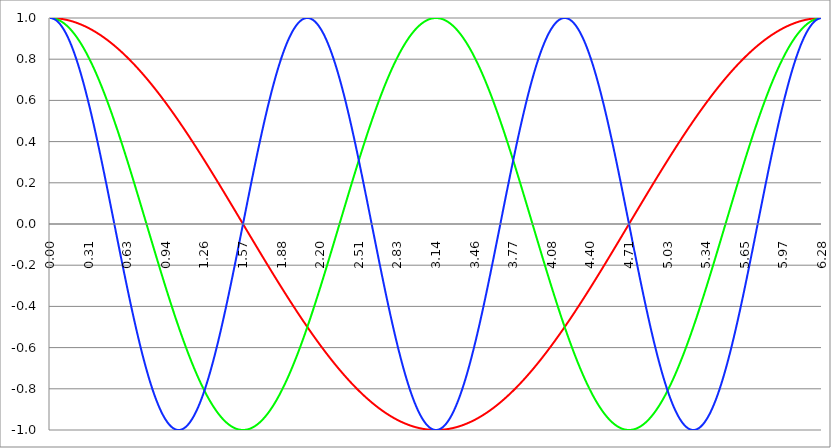
| Category | Series 1 | Series 0 | Series 2 |
|---|---|---|---|
| 0.0 | 1 | 1 | 1 |
| 0.00314159265358979 | 1 | 1 | 1 |
| 0.00628318530717958 | 1 | 1 | 1 |
| 0.00942477796076938 | 1 | 1 | 1 |
| 0.0125663706143592 | 1 | 1 | 0.999 |
| 0.015707963267949 | 1 | 1 | 0.999 |
| 0.0188495559215388 | 1 | 0.999 | 0.998 |
| 0.0219911485751285 | 1 | 0.999 | 0.998 |
| 0.0251327412287183 | 1 | 0.999 | 0.997 |
| 0.0282743338823081 | 1 | 0.998 | 0.996 |
| 0.0314159265358979 | 1 | 0.998 | 0.996 |
| 0.0345575191894877 | 0.999 | 0.998 | 0.995 |
| 0.0376991118430775 | 0.999 | 0.997 | 0.994 |
| 0.0408407044966673 | 0.999 | 0.997 | 0.993 |
| 0.0439822971502571 | 0.999 | 0.996 | 0.991 |
| 0.0471238898038469 | 0.999 | 0.996 | 0.99 |
| 0.0502654824574367 | 0.999 | 0.995 | 0.989 |
| 0.0534070751110265 | 0.999 | 0.994 | 0.987 |
| 0.0565486677646163 | 0.998 | 0.994 | 0.986 |
| 0.059690260418206 | 0.998 | 0.993 | 0.984 |
| 0.0628318530717958 | 0.998 | 0.992 | 0.982 |
| 0.0659734457253856 | 0.998 | 0.991 | 0.98 |
| 0.0691150383789754 | 0.998 | 0.99 | 0.979 |
| 0.0722566310325652 | 0.997 | 0.99 | 0.977 |
| 0.075398223686155 | 0.997 | 0.989 | 0.975 |
| 0.0785398163397448 | 0.997 | 0.988 | 0.972 |
| 0.0816814089933346 | 0.997 | 0.987 | 0.97 |
| 0.0848230016469244 | 0.996 | 0.986 | 0.968 |
| 0.0879645943005142 | 0.996 | 0.985 | 0.965 |
| 0.091106186954104 | 0.996 | 0.983 | 0.963 |
| 0.0942477796076937 | 0.996 | 0.982 | 0.96 |
| 0.0973893722612835 | 0.995 | 0.981 | 0.958 |
| 0.100530964914873 | 0.995 | 0.98 | 0.955 |
| 0.103672557568463 | 0.995 | 0.979 | 0.952 |
| 0.106814150222053 | 0.994 | 0.977 | 0.949 |
| 0.109955742875643 | 0.994 | 0.976 | 0.946 |
| 0.113097335529233 | 0.994 | 0.975 | 0.943 |
| 0.116238928182822 | 0.993 | 0.973 | 0.94 |
| 0.119380520836412 | 0.993 | 0.972 | 0.937 |
| 0.122522113490002 | 0.993 | 0.97 | 0.933 |
| 0.125663706143592 | 0.992 | 0.969 | 0.93 |
| 0.128805298797181 | 0.992 | 0.967 | 0.926 |
| 0.131946891450771 | 0.991 | 0.965 | 0.923 |
| 0.135088484104361 | 0.991 | 0.964 | 0.919 |
| 0.138230076757951 | 0.99 | 0.962 | 0.915 |
| 0.141371669411541 | 0.99 | 0.96 | 0.911 |
| 0.14451326206513 | 0.99 | 0.959 | 0.907 |
| 0.14765485471872 | 0.989 | 0.957 | 0.903 |
| 0.15079644737231 | 0.989 | 0.955 | 0.899 |
| 0.1539380400259 | 0.988 | 0.953 | 0.895 |
| 0.15707963267949 | 0.988 | 0.951 | 0.891 |
| 0.160221225333079 | 0.987 | 0.949 | 0.887 |
| 0.163362817986669 | 0.987 | 0.947 | 0.882 |
| 0.166504410640259 | 0.986 | 0.945 | 0.878 |
| 0.169646003293849 | 0.986 | 0.943 | 0.873 |
| 0.172787595947439 | 0.985 | 0.941 | 0.869 |
| 0.175929188601028 | 0.985 | 0.939 | 0.864 |
| 0.179070781254618 | 0.984 | 0.937 | 0.859 |
| 0.182212373908208 | 0.983 | 0.934 | 0.854 |
| 0.185353966561798 | 0.983 | 0.932 | 0.849 |
| 0.188495559215388 | 0.982 | 0.93 | 0.844 |
| 0.191637151868977 | 0.982 | 0.927 | 0.839 |
| 0.194778744522567 | 0.981 | 0.925 | 0.834 |
| 0.197920337176157 | 0.98 | 0.923 | 0.829 |
| 0.201061929829747 | 0.98 | 0.92 | 0.824 |
| 0.204203522483336 | 0.979 | 0.918 | 0.818 |
| 0.207345115136926 | 0.979 | 0.915 | 0.813 |
| 0.210486707790516 | 0.978 | 0.913 | 0.807 |
| 0.213628300444106 | 0.977 | 0.91 | 0.802 |
| 0.216769893097696 | 0.977 | 0.907 | 0.796 |
| 0.219911485751285 | 0.976 | 0.905 | 0.79 |
| 0.223053078404875 | 0.975 | 0.902 | 0.784 |
| 0.226194671058465 | 0.975 | 0.899 | 0.778 |
| 0.229336263712055 | 0.974 | 0.897 | 0.773 |
| 0.232477856365645 | 0.973 | 0.894 | 0.766 |
| 0.235619449019234 | 0.972 | 0.891 | 0.76 |
| 0.238761041672824 | 0.972 | 0.888 | 0.754 |
| 0.241902634326414 | 0.971 | 0.885 | 0.748 |
| 0.245044226980004 | 0.97 | 0.882 | 0.742 |
| 0.248185819633594 | 0.969 | 0.879 | 0.735 |
| 0.251327412287183 | 0.969 | 0.876 | 0.729 |
| 0.254469004940773 | 0.968 | 0.873 | 0.722 |
| 0.257610597594363 | 0.967 | 0.87 | 0.716 |
| 0.260752190247953 | 0.966 | 0.867 | 0.709 |
| 0.263893782901543 | 0.965 | 0.864 | 0.703 |
| 0.267035375555132 | 0.965 | 0.861 | 0.696 |
| 0.270176968208722 | 0.964 | 0.858 | 0.689 |
| 0.273318560862312 | 0.963 | 0.854 | 0.682 |
| 0.276460153515902 | 0.962 | 0.851 | 0.675 |
| 0.279601746169492 | 0.961 | 0.848 | 0.668 |
| 0.282743338823082 | 0.96 | 0.844 | 0.661 |
| 0.285884931476671 | 0.959 | 0.841 | 0.654 |
| 0.289026524130261 | 0.959 | 0.838 | 0.647 |
| 0.292168116783851 | 0.958 | 0.834 | 0.64 |
| 0.295309709437441 | 0.957 | 0.831 | 0.633 |
| 0.298451302091031 | 0.956 | 0.827 | 0.625 |
| 0.30159289474462 | 0.955 | 0.824 | 0.618 |
| 0.30473448739821 | 0.954 | 0.82 | 0.61 |
| 0.3078760800518 | 0.953 | 0.816 | 0.603 |
| 0.31101767270539 | 0.952 | 0.813 | 0.595 |
| 0.31415926535898 | 0.951 | 0.809 | 0.588 |
| 0.31730085801257 | 0.95 | 0.805 | 0.58 |
| 0.320442450666159 | 0.949 | 0.802 | 0.572 |
| 0.323584043319749 | 0.948 | 0.798 | 0.565 |
| 0.326725635973339 | 0.947 | 0.794 | 0.557 |
| 0.329867228626929 | 0.946 | 0.79 | 0.549 |
| 0.333008821280519 | 0.945 | 0.786 | 0.541 |
| 0.336150413934108 | 0.944 | 0.782 | 0.533 |
| 0.339292006587698 | 0.943 | 0.778 | 0.525 |
| 0.342433599241288 | 0.942 | 0.775 | 0.517 |
| 0.345575191894878 | 0.941 | 0.771 | 0.509 |
| 0.348716784548468 | 0.94 | 0.766 | 0.501 |
| 0.351858377202058 | 0.939 | 0.762 | 0.493 |
| 0.354999969855647 | 0.938 | 0.758 | 0.485 |
| 0.358141562509237 | 0.937 | 0.754 | 0.476 |
| 0.361283155162827 | 0.935 | 0.75 | 0.468 |
| 0.364424747816417 | 0.934 | 0.746 | 0.46 |
| 0.367566340470007 | 0.933 | 0.742 | 0.451 |
| 0.370707933123597 | 0.932 | 0.738 | 0.443 |
| 0.373849525777186 | 0.931 | 0.733 | 0.434 |
| 0.376991118430776 | 0.93 | 0.729 | 0.426 |
| 0.380132711084366 | 0.929 | 0.725 | 0.417 |
| 0.383274303737956 | 0.927 | 0.72 | 0.409 |
| 0.386415896391546 | 0.926 | 0.716 | 0.4 |
| 0.389557489045135 | 0.925 | 0.712 | 0.391 |
| 0.392699081698725 | 0.924 | 0.707 | 0.383 |
| 0.395840674352315 | 0.923 | 0.703 | 0.374 |
| 0.398982267005905 | 0.921 | 0.698 | 0.365 |
| 0.402123859659495 | 0.92 | 0.694 | 0.356 |
| 0.405265452313085 | 0.919 | 0.689 | 0.348 |
| 0.408407044966674 | 0.918 | 0.685 | 0.339 |
| 0.411548637620264 | 0.917 | 0.68 | 0.33 |
| 0.414690230273854 | 0.915 | 0.675 | 0.321 |
| 0.417831822927444 | 0.914 | 0.671 | 0.312 |
| 0.420973415581034 | 0.913 | 0.666 | 0.303 |
| 0.424115008234623 | 0.911 | 0.661 | 0.294 |
| 0.427256600888213 | 0.91 | 0.657 | 0.285 |
| 0.430398193541803 | 0.909 | 0.652 | 0.276 |
| 0.433539786195393 | 0.907 | 0.647 | 0.267 |
| 0.436681378848983 | 0.906 | 0.642 | 0.258 |
| 0.439822971502573 | 0.905 | 0.637 | 0.249 |
| 0.442964564156162 | 0.903 | 0.633 | 0.24 |
| 0.446106156809752 | 0.902 | 0.628 | 0.23 |
| 0.449247749463342 | 0.901 | 0.623 | 0.221 |
| 0.452389342116932 | 0.899 | 0.618 | 0.212 |
| 0.455530934770522 | 0.898 | 0.613 | 0.203 |
| 0.458672527424111 | 0.897 | 0.608 | 0.194 |
| 0.461814120077701 | 0.895 | 0.603 | 0.184 |
| 0.464955712731291 | 0.894 | 0.598 | 0.175 |
| 0.468097305384881 | 0.892 | 0.593 | 0.166 |
| 0.471238898038471 | 0.891 | 0.588 | 0.156 |
| 0.474380490692061 | 0.89 | 0.583 | 0.147 |
| 0.47752208334565 | 0.888 | 0.578 | 0.138 |
| 0.48066367599924 | 0.887 | 0.572 | 0.128 |
| 0.48380526865283 | 0.885 | 0.567 | 0.119 |
| 0.48694686130642 | 0.884 | 0.562 | 0.11 |
| 0.49008845396001 | 0.882 | 0.557 | 0.1 |
| 0.493230046613599 | 0.881 | 0.552 | 0.091 |
| 0.496371639267189 | 0.879 | 0.546 | 0.082 |
| 0.499513231920779 | 0.878 | 0.541 | 0.072 |
| 0.502654824574369 | 0.876 | 0.536 | 0.063 |
| 0.505796417227959 | 0.875 | 0.531 | 0.053 |
| 0.508938009881549 | 0.873 | 0.525 | 0.044 |
| 0.512079602535138 | 0.872 | 0.52 | 0.035 |
| 0.515221195188728 | 0.87 | 0.514 | 0.025 |
| 0.518362787842318 | 0.869 | 0.509 | 0.016 |
| 0.521504380495908 | 0.867 | 0.504 | 0.006 |
| 0.524645973149498 | 0.866 | 0.498 | -0.003 |
| 0.527787565803087 | 0.864 | 0.493 | -0.013 |
| 0.530929158456677 | 0.862 | 0.487 | -0.022 |
| 0.534070751110267 | 0.861 | 0.482 | -0.031 |
| 0.537212343763857 | 0.859 | 0.476 | -0.041 |
| 0.540353936417447 | 0.858 | 0.471 | -0.05 |
| 0.543495529071037 | 0.856 | 0.465 | -0.06 |
| 0.546637121724626 | 0.854 | 0.46 | -0.069 |
| 0.549778714378216 | 0.853 | 0.454 | -0.078 |
| 0.552920307031806 | 0.851 | 0.448 | -0.088 |
| 0.556061899685396 | 0.849 | 0.443 | -0.097 |
| 0.559203492338986 | 0.848 | 0.437 | -0.107 |
| 0.562345084992576 | 0.846 | 0.431 | -0.116 |
| 0.565486677646165 | 0.844 | 0.426 | -0.125 |
| 0.568628270299755 | 0.843 | 0.42 | -0.135 |
| 0.571769862953345 | 0.841 | 0.414 | -0.144 |
| 0.574911455606935 | 0.839 | 0.409 | -0.153 |
| 0.578053048260525 | 0.838 | 0.403 | -0.163 |
| 0.581194640914114 | 0.836 | 0.397 | -0.172 |
| 0.584336233567704 | 0.834 | 0.391 | -0.181 |
| 0.587477826221294 | 0.832 | 0.386 | -0.19 |
| 0.590619418874884 | 0.831 | 0.38 | -0.2 |
| 0.593761011528474 | 0.829 | 0.374 | -0.209 |
| 0.596902604182064 | 0.827 | 0.368 | -0.218 |
| 0.600044196835653 | 0.825 | 0.362 | -0.227 |
| 0.603185789489243 | 0.824 | 0.356 | -0.236 |
| 0.606327382142833 | 0.822 | 0.351 | -0.246 |
| 0.609468974796423 | 0.82 | 0.345 | -0.255 |
| 0.612610567450013 | 0.818 | 0.339 | -0.264 |
| 0.615752160103602 | 0.816 | 0.333 | -0.273 |
| 0.618893752757192 | 0.815 | 0.327 | -0.282 |
| 0.622035345410782 | 0.813 | 0.321 | -0.291 |
| 0.625176938064372 | 0.811 | 0.315 | -0.3 |
| 0.628318530717962 | 0.809 | 0.309 | -0.309 |
| 0.631460123371551 | 0.807 | 0.303 | -0.318 |
| 0.634601716025141 | 0.805 | 0.297 | -0.327 |
| 0.637743308678731 | 0.803 | 0.291 | -0.336 |
| 0.640884901332321 | 0.802 | 0.285 | -0.345 |
| 0.644026493985911 | 0.8 | 0.279 | -0.353 |
| 0.647168086639501 | 0.798 | 0.273 | -0.362 |
| 0.65030967929309 | 0.796 | 0.267 | -0.371 |
| 0.65345127194668 | 0.794 | 0.261 | -0.38 |
| 0.65659286460027 | 0.792 | 0.255 | -0.388 |
| 0.65973445725386 | 0.79 | 0.249 | -0.397 |
| 0.66287604990745 | 0.788 | 0.243 | -0.406 |
| 0.666017642561039 | 0.786 | 0.236 | -0.414 |
| 0.669159235214629 | 0.784 | 0.23 | -0.423 |
| 0.672300827868219 | 0.782 | 0.224 | -0.431 |
| 0.675442420521809 | 0.78 | 0.218 | -0.44 |
| 0.678584013175399 | 0.778 | 0.212 | -0.448 |
| 0.681725605828989 | 0.776 | 0.206 | -0.457 |
| 0.684867198482578 | 0.775 | 0.2 | -0.465 |
| 0.688008791136168 | 0.773 | 0.194 | -0.473 |
| 0.691150383789758 | 0.771 | 0.187 | -0.482 |
| 0.694291976443348 | 0.769 | 0.181 | -0.49 |
| 0.697433569096938 | 0.766 | 0.175 | -0.498 |
| 0.700575161750528 | 0.764 | 0.169 | -0.506 |
| 0.703716754404117 | 0.762 | 0.163 | -0.514 |
| 0.706858347057707 | 0.76 | 0.156 | -0.522 |
| 0.709999939711297 | 0.758 | 0.15 | -0.531 |
| 0.713141532364887 | 0.756 | 0.144 | -0.538 |
| 0.716283125018477 | 0.754 | 0.138 | -0.546 |
| 0.719424717672066 | 0.752 | 0.132 | -0.554 |
| 0.722566310325656 | 0.75 | 0.125 | -0.562 |
| 0.725707902979246 | 0.748 | 0.119 | -0.57 |
| 0.728849495632836 | 0.746 | 0.113 | -0.578 |
| 0.731991088286426 | 0.744 | 0.107 | -0.585 |
| 0.735132680940016 | 0.742 | 0.1 | -0.593 |
| 0.738274273593605 | 0.74 | 0.094 | -0.6 |
| 0.741415866247195 | 0.738 | 0.088 | -0.608 |
| 0.744557458900785 | 0.735 | 0.082 | -0.615 |
| 0.747699051554375 | 0.733 | 0.075 | -0.623 |
| 0.750840644207965 | 0.731 | 0.069 | -0.63 |
| 0.753982236861554 | 0.729 | 0.063 | -0.637 |
| 0.757123829515144 | 0.727 | 0.057 | -0.645 |
| 0.760265422168734 | 0.725 | 0.05 | -0.652 |
| 0.763407014822324 | 0.722 | 0.044 | -0.659 |
| 0.766548607475914 | 0.72 | 0.038 | -0.666 |
| 0.769690200129504 | 0.718 | 0.031 | -0.673 |
| 0.772831792783093 | 0.716 | 0.025 | -0.68 |
| 0.775973385436683 | 0.714 | 0.019 | -0.687 |
| 0.779114978090273 | 0.712 | 0.013 | -0.694 |
| 0.782256570743863 | 0.709 | 0.006 | -0.7 |
| 0.785398163397453 | 0.707 | 0 | -0.707 |
| 0.788539756051042 | 0.705 | -0.006 | -0.714 |
| 0.791681348704632 | 0.703 | -0.013 | -0.72 |
| 0.794822941358222 | 0.7 | -0.019 | -0.727 |
| 0.797964534011812 | 0.698 | -0.025 | -0.733 |
| 0.801106126665402 | 0.696 | -0.031 | -0.74 |
| 0.804247719318992 | 0.694 | -0.038 | -0.746 |
| 0.807389311972581 | 0.691 | -0.044 | -0.752 |
| 0.810530904626171 | 0.689 | -0.05 | -0.758 |
| 0.813672497279761 | 0.687 | -0.057 | -0.764 |
| 0.816814089933351 | 0.685 | -0.063 | -0.771 |
| 0.819955682586941 | 0.682 | -0.069 | -0.776 |
| 0.823097275240531 | 0.68 | -0.075 | -0.782 |
| 0.82623886789412 | 0.678 | -0.082 | -0.788 |
| 0.82938046054771 | 0.675 | -0.088 | -0.794 |
| 0.8325220532013 | 0.673 | -0.094 | -0.8 |
| 0.83566364585489 | 0.671 | -0.1 | -0.805 |
| 0.83880523850848 | 0.668 | -0.107 | -0.811 |
| 0.841946831162069 | 0.666 | -0.113 | -0.816 |
| 0.845088423815659 | 0.664 | -0.119 | -0.822 |
| 0.848230016469249 | 0.661 | -0.125 | -0.827 |
| 0.851371609122839 | 0.659 | -0.132 | -0.832 |
| 0.854513201776429 | 0.657 | -0.138 | -0.838 |
| 0.857654794430019 | 0.654 | -0.144 | -0.843 |
| 0.860796387083608 | 0.652 | -0.15 | -0.848 |
| 0.863937979737198 | 0.649 | -0.156 | -0.853 |
| 0.867079572390788 | 0.647 | -0.163 | -0.858 |
| 0.870221165044378 | 0.645 | -0.169 | -0.862 |
| 0.873362757697968 | 0.642 | -0.175 | -0.867 |
| 0.876504350351557 | 0.64 | -0.181 | -0.872 |
| 0.879645943005147 | 0.637 | -0.187 | -0.876 |
| 0.882787535658737 | 0.635 | -0.194 | -0.881 |
| 0.885929128312327 | 0.633 | -0.2 | -0.885 |
| 0.889070720965917 | 0.63 | -0.206 | -0.89 |
| 0.892212313619507 | 0.628 | -0.212 | -0.894 |
| 0.895353906273096 | 0.625 | -0.218 | -0.898 |
| 0.898495498926686 | 0.623 | -0.224 | -0.902 |
| 0.901637091580276 | 0.62 | -0.23 | -0.906 |
| 0.904778684233866 | 0.618 | -0.236 | -0.91 |
| 0.907920276887456 | 0.615 | -0.243 | -0.914 |
| 0.911061869541045 | 0.613 | -0.249 | -0.918 |
| 0.914203462194635 | 0.61 | -0.255 | -0.921 |
| 0.917345054848225 | 0.608 | -0.261 | -0.925 |
| 0.920486647501815 | 0.605 | -0.267 | -0.929 |
| 0.923628240155405 | 0.603 | -0.273 | -0.932 |
| 0.926769832808995 | 0.6 | -0.279 | -0.935 |
| 0.929911425462584 | 0.598 | -0.285 | -0.939 |
| 0.933053018116174 | 0.595 | -0.291 | -0.942 |
| 0.936194610769764 | 0.593 | -0.297 | -0.945 |
| 0.939336203423354 | 0.59 | -0.303 | -0.948 |
| 0.942477796076944 | 0.588 | -0.309 | -0.951 |
| 0.945619388730533 | 0.585 | -0.315 | -0.954 |
| 0.948760981384123 | 0.583 | -0.321 | -0.957 |
| 0.951902574037713 | 0.58 | -0.327 | -0.959 |
| 0.955044166691303 | 0.578 | -0.333 | -0.962 |
| 0.958185759344893 | 0.575 | -0.339 | -0.965 |
| 0.961327351998483 | 0.572 | -0.345 | -0.967 |
| 0.964468944652072 | 0.57 | -0.351 | -0.969 |
| 0.967610537305662 | 0.567 | -0.356 | -0.972 |
| 0.970752129959252 | 0.565 | -0.362 | -0.974 |
| 0.973893722612842 | 0.562 | -0.368 | -0.976 |
| 0.977035315266432 | 0.559 | -0.374 | -0.978 |
| 0.980176907920022 | 0.557 | -0.38 | -0.98 |
| 0.983318500573611 | 0.554 | -0.386 | -0.982 |
| 0.986460093227201 | 0.552 | -0.391 | -0.983 |
| 0.989601685880791 | 0.549 | -0.397 | -0.985 |
| 0.992743278534381 | 0.546 | -0.403 | -0.987 |
| 0.995884871187971 | 0.544 | -0.409 | -0.988 |
| 0.99902646384156 | 0.541 | -0.414 | -0.99 |
| 1.00216805649515 | 0.538 | -0.42 | -0.991 |
| 1.00530964914874 | 0.536 | -0.426 | -0.992 |
| 1.00845124180233 | 0.533 | -0.431 | -0.993 |
| 1.01159283445592 | 0.531 | -0.437 | -0.994 |
| 1.01473442710951 | 0.528 | -0.443 | -0.995 |
| 1.017876019763099 | 0.525 | -0.448 | -0.996 |
| 1.021017612416689 | 0.522 | -0.454 | -0.997 |
| 1.02415920507028 | 0.52 | -0.46 | -0.998 |
| 1.027300797723869 | 0.517 | -0.465 | -0.998 |
| 1.030442390377459 | 0.514 | -0.471 | -0.999 |
| 1.033583983031048 | 0.512 | -0.476 | -0.999 |
| 1.036725575684638 | 0.509 | -0.482 | -1 |
| 1.039867168338228 | 0.506 | -0.487 | -1 |
| 1.043008760991818 | 0.504 | -0.493 | -1 |
| 1.046150353645408 | 0.501 | -0.498 | -1 |
| 1.049291946298998 | 0.498 | -0.504 | -1 |
| 1.052433538952587 | 0.495 | -0.509 | -1 |
| 1.055575131606177 | 0.493 | -0.514 | -1 |
| 1.058716724259767 | 0.49 | -0.52 | -0.999 |
| 1.061858316913357 | 0.487 | -0.525 | -0.999 |
| 1.064999909566947 | 0.485 | -0.531 | -0.999 |
| 1.068141502220536 | 0.482 | -0.536 | -0.998 |
| 1.071283094874126 | 0.479 | -0.541 | -0.997 |
| 1.074424687527716 | 0.476 | -0.546 | -0.997 |
| 1.077566280181306 | 0.473 | -0.552 | -0.996 |
| 1.080707872834896 | 0.471 | -0.557 | -0.995 |
| 1.083849465488486 | 0.468 | -0.562 | -0.994 |
| 1.086991058142075 | 0.465 | -0.567 | -0.993 |
| 1.090132650795665 | 0.462 | -0.572 | -0.992 |
| 1.093274243449255 | 0.46 | -0.578 | -0.99 |
| 1.096415836102845 | 0.457 | -0.583 | -0.989 |
| 1.099557428756435 | 0.454 | -0.588 | -0.988 |
| 1.102699021410025 | 0.451 | -0.593 | -0.986 |
| 1.105840614063614 | 0.448 | -0.598 | -0.985 |
| 1.108982206717204 | 0.446 | -0.603 | -0.983 |
| 1.112123799370794 | 0.443 | -0.608 | -0.981 |
| 1.115265392024384 | 0.44 | -0.613 | -0.979 |
| 1.118406984677974 | 0.437 | -0.618 | -0.977 |
| 1.121548577331563 | 0.434 | -0.623 | -0.975 |
| 1.124690169985153 | 0.431 | -0.628 | -0.973 |
| 1.127831762638743 | 0.429 | -0.633 | -0.971 |
| 1.130973355292333 | 0.426 | -0.637 | -0.969 |
| 1.134114947945923 | 0.423 | -0.642 | -0.966 |
| 1.137256540599513 | 0.42 | -0.647 | -0.964 |
| 1.140398133253102 | 0.417 | -0.652 | -0.961 |
| 1.143539725906692 | 0.414 | -0.657 | -0.959 |
| 1.146681318560282 | 0.412 | -0.661 | -0.956 |
| 1.149822911213872 | 0.409 | -0.666 | -0.953 |
| 1.152964503867462 | 0.406 | -0.671 | -0.95 |
| 1.156106096521051 | 0.403 | -0.675 | -0.947 |
| 1.159247689174641 | 0.4 | -0.68 | -0.944 |
| 1.162389281828231 | 0.397 | -0.685 | -0.941 |
| 1.165530874481821 | 0.394 | -0.689 | -0.938 |
| 1.168672467135411 | 0.391 | -0.694 | -0.934 |
| 1.171814059789001 | 0.388 | -0.698 | -0.931 |
| 1.17495565244259 | 0.386 | -0.703 | -0.927 |
| 1.17809724509618 | 0.383 | -0.707 | -0.924 |
| 1.18123883774977 | 0.38 | -0.712 | -0.92 |
| 1.18438043040336 | 0.377 | -0.716 | -0.917 |
| 1.18752202305695 | 0.374 | -0.72 | -0.913 |
| 1.190663615710539 | 0.371 | -0.725 | -0.909 |
| 1.193805208364129 | 0.368 | -0.729 | -0.905 |
| 1.19694680101772 | 0.365 | -0.733 | -0.901 |
| 1.200088393671309 | 0.362 | -0.738 | -0.897 |
| 1.203229986324899 | 0.359 | -0.742 | -0.892 |
| 1.206371578978489 | 0.356 | -0.746 | -0.888 |
| 1.209513171632078 | 0.353 | -0.75 | -0.884 |
| 1.212654764285668 | 0.351 | -0.754 | -0.879 |
| 1.215796356939258 | 0.348 | -0.758 | -0.875 |
| 1.218937949592848 | 0.345 | -0.762 | -0.87 |
| 1.222079542246438 | 0.342 | -0.766 | -0.866 |
| 1.225221134900027 | 0.339 | -0.771 | -0.861 |
| 1.228362727553617 | 0.336 | -0.775 | -0.856 |
| 1.231504320207207 | 0.333 | -0.778 | -0.851 |
| 1.234645912860797 | 0.33 | -0.782 | -0.846 |
| 1.237787505514387 | 0.327 | -0.786 | -0.841 |
| 1.240929098167977 | 0.324 | -0.79 | -0.836 |
| 1.244070690821566 | 0.321 | -0.794 | -0.831 |
| 1.247212283475156 | 0.318 | -0.798 | -0.825 |
| 1.250353876128746 | 0.315 | -0.802 | -0.82 |
| 1.253495468782336 | 0.312 | -0.805 | -0.815 |
| 1.256637061435926 | 0.309 | -0.809 | -0.809 |
| 1.259778654089515 | 0.306 | -0.813 | -0.803 |
| 1.262920246743105 | 0.303 | -0.816 | -0.798 |
| 1.266061839396695 | 0.3 | -0.82 | -0.792 |
| 1.269203432050285 | 0.297 | -0.824 | -0.786 |
| 1.272345024703875 | 0.294 | -0.827 | -0.78 |
| 1.275486617357465 | 0.291 | -0.831 | -0.775 |
| 1.278628210011054 | 0.288 | -0.834 | -0.769 |
| 1.281769802664644 | 0.285 | -0.838 | -0.762 |
| 1.284911395318234 | 0.282 | -0.841 | -0.756 |
| 1.288052987971824 | 0.279 | -0.844 | -0.75 |
| 1.291194580625414 | 0.276 | -0.848 | -0.744 |
| 1.294336173279003 | 0.273 | -0.851 | -0.738 |
| 1.297477765932593 | 0.27 | -0.854 | -0.731 |
| 1.300619358586183 | 0.267 | -0.858 | -0.725 |
| 1.303760951239773 | 0.264 | -0.861 | -0.718 |
| 1.306902543893363 | 0.261 | -0.864 | -0.712 |
| 1.310044136546953 | 0.258 | -0.867 | -0.705 |
| 1.313185729200542 | 0.255 | -0.87 | -0.698 |
| 1.316327321854132 | 0.252 | -0.873 | -0.691 |
| 1.319468914507722 | 0.249 | -0.876 | -0.685 |
| 1.322610507161312 | 0.246 | -0.879 | -0.678 |
| 1.325752099814902 | 0.243 | -0.882 | -0.671 |
| 1.328893692468491 | 0.24 | -0.885 | -0.664 |
| 1.332035285122081 | 0.236 | -0.888 | -0.657 |
| 1.335176877775671 | 0.233 | -0.891 | -0.649 |
| 1.338318470429261 | 0.23 | -0.894 | -0.642 |
| 1.341460063082851 | 0.227 | -0.897 | -0.635 |
| 1.344601655736441 | 0.224 | -0.899 | -0.628 |
| 1.34774324839003 | 0.221 | -0.902 | -0.62 |
| 1.35088484104362 | 0.218 | -0.905 | -0.613 |
| 1.35402643369721 | 0.215 | -0.907 | -0.605 |
| 1.3571680263508 | 0.212 | -0.91 | -0.598 |
| 1.36030961900439 | 0.209 | -0.913 | -0.59 |
| 1.363451211657979 | 0.206 | -0.915 | -0.583 |
| 1.36659280431157 | 0.203 | -0.918 | -0.575 |
| 1.369734396965159 | 0.2 | -0.92 | -0.567 |
| 1.372875989618749 | 0.197 | -0.923 | -0.559 |
| 1.376017582272339 | 0.194 | -0.925 | -0.552 |
| 1.379159174925929 | 0.19 | -0.927 | -0.544 |
| 1.382300767579518 | 0.187 | -0.93 | -0.536 |
| 1.385442360233108 | 0.184 | -0.932 | -0.528 |
| 1.388583952886698 | 0.181 | -0.934 | -0.52 |
| 1.391725545540288 | 0.178 | -0.937 | -0.512 |
| 1.394867138193878 | 0.175 | -0.939 | -0.504 |
| 1.398008730847468 | 0.172 | -0.941 | -0.495 |
| 1.401150323501057 | 0.169 | -0.943 | -0.487 |
| 1.404291916154647 | 0.166 | -0.945 | -0.479 |
| 1.407433508808237 | 0.163 | -0.947 | -0.471 |
| 1.410575101461827 | 0.16 | -0.949 | -0.462 |
| 1.413716694115417 | 0.156 | -0.951 | -0.454 |
| 1.416858286769006 | 0.153 | -0.953 | -0.446 |
| 1.419999879422596 | 0.15 | -0.955 | -0.437 |
| 1.423141472076186 | 0.147 | -0.957 | -0.429 |
| 1.426283064729776 | 0.144 | -0.959 | -0.42 |
| 1.429424657383366 | 0.141 | -0.96 | -0.412 |
| 1.432566250036956 | 0.138 | -0.962 | -0.403 |
| 1.435707842690545 | 0.135 | -0.964 | -0.394 |
| 1.438849435344135 | 0.132 | -0.965 | -0.386 |
| 1.441991027997725 | 0.128 | -0.967 | -0.377 |
| 1.445132620651315 | 0.125 | -0.969 | -0.368 |
| 1.448274213304905 | 0.122 | -0.97 | -0.359 |
| 1.451415805958494 | 0.119 | -0.972 | -0.351 |
| 1.454557398612084 | 0.116 | -0.973 | -0.342 |
| 1.457698991265674 | 0.113 | -0.975 | -0.333 |
| 1.460840583919264 | 0.11 | -0.976 | -0.324 |
| 1.463982176572854 | 0.107 | -0.977 | -0.315 |
| 1.467123769226444 | 0.103 | -0.979 | -0.306 |
| 1.470265361880033 | 0.1 | -0.98 | -0.297 |
| 1.473406954533623 | 0.097 | -0.981 | -0.288 |
| 1.476548547187213 | 0.094 | -0.982 | -0.279 |
| 1.479690139840803 | 0.091 | -0.983 | -0.27 |
| 1.482831732494393 | 0.088 | -0.985 | -0.261 |
| 1.485973325147982 | 0.085 | -0.986 | -0.252 |
| 1.489114917801572 | 0.082 | -0.987 | -0.243 |
| 1.492256510455162 | 0.078 | -0.988 | -0.233 |
| 1.495398103108752 | 0.075 | -0.989 | -0.224 |
| 1.498539695762342 | 0.072 | -0.99 | -0.215 |
| 1.501681288415932 | 0.069 | -0.99 | -0.206 |
| 1.504822881069521 | 0.066 | -0.991 | -0.197 |
| 1.507964473723111 | 0.063 | -0.992 | -0.187 |
| 1.511106066376701 | 0.06 | -0.993 | -0.178 |
| 1.514247659030291 | 0.057 | -0.994 | -0.169 |
| 1.517389251683881 | 0.053 | -0.994 | -0.16 |
| 1.520530844337471 | 0.05 | -0.995 | -0.15 |
| 1.52367243699106 | 0.047 | -0.996 | -0.141 |
| 1.52681402964465 | 0.044 | -0.996 | -0.132 |
| 1.52995562229824 | 0.041 | -0.997 | -0.122 |
| 1.53309721495183 | 0.038 | -0.997 | -0.113 |
| 1.53623880760542 | 0.035 | -0.998 | -0.103 |
| 1.539380400259009 | 0.031 | -0.998 | -0.094 |
| 1.542521992912599 | 0.028 | -0.998 | -0.085 |
| 1.545663585566189 | 0.025 | -0.999 | -0.075 |
| 1.548805178219779 | 0.022 | -0.999 | -0.066 |
| 1.551946770873369 | 0.019 | -0.999 | -0.057 |
| 1.555088363526959 | 0.016 | -1 | -0.047 |
| 1.558229956180548 | 0.013 | -1 | -0.038 |
| 1.561371548834138 | 0.009 | -1 | -0.028 |
| 1.564513141487728 | 0.006 | -1 | -0.019 |
| 1.567654734141318 | 0.003 | -1 | -0.009 |
| 1.570796326794908 | 0 | -1 | 0 |
| 1.573937919448497 | -0.003 | -1 | 0.009 |
| 1.577079512102087 | -0.006 | -1 | 0.019 |
| 1.580221104755677 | -0.009 | -1 | 0.028 |
| 1.583362697409267 | -0.013 | -1 | 0.038 |
| 1.586504290062857 | -0.016 | -1 | 0.047 |
| 1.589645882716447 | -0.019 | -0.999 | 0.057 |
| 1.592787475370036 | -0.022 | -0.999 | 0.066 |
| 1.595929068023626 | -0.025 | -0.999 | 0.075 |
| 1.599070660677216 | -0.028 | -0.998 | 0.085 |
| 1.602212253330806 | -0.031 | -0.998 | 0.094 |
| 1.605353845984396 | -0.035 | -0.998 | 0.103 |
| 1.608495438637985 | -0.038 | -0.997 | 0.113 |
| 1.611637031291575 | -0.041 | -0.997 | 0.122 |
| 1.614778623945165 | -0.044 | -0.996 | 0.132 |
| 1.617920216598755 | -0.047 | -0.996 | 0.141 |
| 1.621061809252345 | -0.05 | -0.995 | 0.15 |
| 1.624203401905935 | -0.053 | -0.994 | 0.16 |
| 1.627344994559524 | -0.057 | -0.994 | 0.169 |
| 1.630486587213114 | -0.06 | -0.993 | 0.178 |
| 1.633628179866704 | -0.063 | -0.992 | 0.187 |
| 1.636769772520294 | -0.066 | -0.991 | 0.197 |
| 1.639911365173884 | -0.069 | -0.99 | 0.206 |
| 1.643052957827473 | -0.072 | -0.99 | 0.215 |
| 1.646194550481063 | -0.075 | -0.989 | 0.224 |
| 1.649336143134653 | -0.078 | -0.988 | 0.233 |
| 1.652477735788243 | -0.082 | -0.987 | 0.243 |
| 1.655619328441833 | -0.085 | -0.986 | 0.252 |
| 1.658760921095423 | -0.088 | -0.985 | 0.261 |
| 1.661902513749012 | -0.091 | -0.983 | 0.27 |
| 1.665044106402602 | -0.094 | -0.982 | 0.279 |
| 1.668185699056192 | -0.097 | -0.981 | 0.288 |
| 1.671327291709782 | -0.1 | -0.98 | 0.297 |
| 1.674468884363372 | -0.103 | -0.979 | 0.306 |
| 1.677610477016961 | -0.107 | -0.977 | 0.315 |
| 1.680752069670551 | -0.11 | -0.976 | 0.324 |
| 1.683893662324141 | -0.113 | -0.975 | 0.333 |
| 1.687035254977731 | -0.116 | -0.973 | 0.342 |
| 1.690176847631321 | -0.119 | -0.972 | 0.351 |
| 1.693318440284911 | -0.122 | -0.97 | 0.359 |
| 1.6964600329385 | -0.125 | -0.969 | 0.368 |
| 1.69960162559209 | -0.128 | -0.967 | 0.377 |
| 1.70274321824568 | -0.132 | -0.965 | 0.386 |
| 1.70588481089927 | -0.135 | -0.964 | 0.394 |
| 1.70902640355286 | -0.138 | -0.962 | 0.403 |
| 1.712167996206449 | -0.141 | -0.96 | 0.412 |
| 1.715309588860039 | -0.144 | -0.959 | 0.42 |
| 1.71845118151363 | -0.147 | -0.957 | 0.429 |
| 1.721592774167219 | -0.15 | -0.955 | 0.437 |
| 1.724734366820809 | -0.153 | -0.953 | 0.446 |
| 1.727875959474399 | -0.156 | -0.951 | 0.454 |
| 1.731017552127988 | -0.16 | -0.949 | 0.462 |
| 1.734159144781578 | -0.163 | -0.947 | 0.471 |
| 1.737300737435168 | -0.166 | -0.945 | 0.479 |
| 1.740442330088758 | -0.169 | -0.943 | 0.487 |
| 1.743583922742348 | -0.172 | -0.941 | 0.495 |
| 1.746725515395937 | -0.175 | -0.939 | 0.504 |
| 1.749867108049527 | -0.178 | -0.937 | 0.512 |
| 1.753008700703117 | -0.181 | -0.934 | 0.52 |
| 1.756150293356707 | -0.184 | -0.932 | 0.528 |
| 1.759291886010297 | -0.187 | -0.93 | 0.536 |
| 1.762433478663887 | -0.19 | -0.927 | 0.544 |
| 1.765575071317476 | -0.194 | -0.925 | 0.552 |
| 1.768716663971066 | -0.197 | -0.923 | 0.559 |
| 1.771858256624656 | -0.2 | -0.92 | 0.567 |
| 1.774999849278246 | -0.203 | -0.918 | 0.575 |
| 1.778141441931836 | -0.206 | -0.915 | 0.583 |
| 1.781283034585426 | -0.209 | -0.913 | 0.59 |
| 1.784424627239015 | -0.212 | -0.91 | 0.598 |
| 1.787566219892605 | -0.215 | -0.907 | 0.605 |
| 1.790707812546195 | -0.218 | -0.905 | 0.613 |
| 1.793849405199785 | -0.221 | -0.902 | 0.62 |
| 1.796990997853375 | -0.224 | -0.899 | 0.628 |
| 1.800132590506964 | -0.227 | -0.897 | 0.635 |
| 1.803274183160554 | -0.23 | -0.894 | 0.642 |
| 1.806415775814144 | -0.233 | -0.891 | 0.649 |
| 1.809557368467734 | -0.236 | -0.888 | 0.657 |
| 1.812698961121324 | -0.24 | -0.885 | 0.664 |
| 1.815840553774914 | -0.243 | -0.882 | 0.671 |
| 1.818982146428503 | -0.246 | -0.879 | 0.678 |
| 1.822123739082093 | -0.249 | -0.876 | 0.685 |
| 1.825265331735683 | -0.252 | -0.873 | 0.691 |
| 1.828406924389273 | -0.255 | -0.87 | 0.698 |
| 1.831548517042863 | -0.258 | -0.867 | 0.705 |
| 1.834690109696452 | -0.261 | -0.864 | 0.712 |
| 1.837831702350042 | -0.264 | -0.861 | 0.718 |
| 1.840973295003632 | -0.267 | -0.858 | 0.725 |
| 1.844114887657222 | -0.27 | -0.854 | 0.731 |
| 1.847256480310812 | -0.273 | -0.851 | 0.738 |
| 1.850398072964402 | -0.276 | -0.848 | 0.744 |
| 1.853539665617991 | -0.279 | -0.844 | 0.75 |
| 1.856681258271581 | -0.282 | -0.841 | 0.756 |
| 1.859822850925171 | -0.285 | -0.838 | 0.762 |
| 1.862964443578761 | -0.288 | -0.834 | 0.769 |
| 1.866106036232351 | -0.291 | -0.831 | 0.775 |
| 1.86924762888594 | -0.294 | -0.827 | 0.78 |
| 1.87238922153953 | -0.297 | -0.824 | 0.786 |
| 1.87553081419312 | -0.3 | -0.82 | 0.792 |
| 1.87867240684671 | -0.303 | -0.816 | 0.798 |
| 1.8818139995003 | -0.306 | -0.813 | 0.803 |
| 1.88495559215389 | -0.309 | -0.809 | 0.809 |
| 1.888097184807479 | -0.312 | -0.805 | 0.815 |
| 1.891238777461069 | -0.315 | -0.802 | 0.82 |
| 1.89438037011466 | -0.318 | -0.798 | 0.825 |
| 1.897521962768249 | -0.321 | -0.794 | 0.831 |
| 1.900663555421839 | -0.324 | -0.79 | 0.836 |
| 1.903805148075429 | -0.327 | -0.786 | 0.841 |
| 1.906946740729018 | -0.33 | -0.782 | 0.846 |
| 1.910088333382608 | -0.333 | -0.778 | 0.851 |
| 1.913229926036198 | -0.336 | -0.775 | 0.856 |
| 1.916371518689788 | -0.339 | -0.771 | 0.861 |
| 1.919513111343378 | -0.342 | -0.766 | 0.866 |
| 1.922654703996967 | -0.345 | -0.762 | 0.87 |
| 1.925796296650557 | -0.348 | -0.758 | 0.875 |
| 1.928937889304147 | -0.351 | -0.754 | 0.879 |
| 1.932079481957737 | -0.353 | -0.75 | 0.884 |
| 1.935221074611327 | -0.356 | -0.746 | 0.888 |
| 1.938362667264917 | -0.359 | -0.742 | 0.892 |
| 1.941504259918506 | -0.362 | -0.738 | 0.897 |
| 1.944645852572096 | -0.365 | -0.733 | 0.901 |
| 1.947787445225686 | -0.368 | -0.729 | 0.905 |
| 1.950929037879276 | -0.371 | -0.725 | 0.909 |
| 1.954070630532866 | -0.374 | -0.72 | 0.913 |
| 1.957212223186455 | -0.377 | -0.716 | 0.917 |
| 1.960353815840045 | -0.38 | -0.712 | 0.92 |
| 1.963495408493635 | -0.383 | -0.707 | 0.924 |
| 1.966637001147225 | -0.386 | -0.703 | 0.927 |
| 1.969778593800815 | -0.388 | -0.698 | 0.931 |
| 1.972920186454405 | -0.391 | -0.694 | 0.934 |
| 1.976061779107994 | -0.394 | -0.689 | 0.938 |
| 1.979203371761584 | -0.397 | -0.685 | 0.941 |
| 1.982344964415174 | -0.4 | -0.68 | 0.944 |
| 1.985486557068764 | -0.403 | -0.675 | 0.947 |
| 1.988628149722354 | -0.406 | -0.671 | 0.95 |
| 1.991769742375943 | -0.409 | -0.666 | 0.953 |
| 1.994911335029533 | -0.412 | -0.661 | 0.956 |
| 1.998052927683123 | -0.414 | -0.657 | 0.959 |
| 2.001194520336712 | -0.417 | -0.652 | 0.961 |
| 2.004336112990302 | -0.42 | -0.647 | 0.964 |
| 2.007477705643892 | -0.423 | -0.642 | 0.966 |
| 2.010619298297482 | -0.426 | -0.637 | 0.969 |
| 2.013760890951071 | -0.429 | -0.633 | 0.971 |
| 2.016902483604661 | -0.431 | -0.628 | 0.973 |
| 2.02004407625825 | -0.434 | -0.623 | 0.975 |
| 2.02318566891184 | -0.437 | -0.618 | 0.977 |
| 2.02632726156543 | -0.44 | -0.613 | 0.979 |
| 2.029468854219019 | -0.443 | -0.608 | 0.981 |
| 2.032610446872609 | -0.446 | -0.603 | 0.983 |
| 2.035752039526198 | -0.448 | -0.598 | 0.985 |
| 2.038893632179788 | -0.451 | -0.593 | 0.986 |
| 2.042035224833378 | -0.454 | -0.588 | 0.988 |
| 2.045176817486967 | -0.457 | -0.583 | 0.989 |
| 2.048318410140557 | -0.46 | -0.578 | 0.99 |
| 2.051460002794146 | -0.462 | -0.572 | 0.992 |
| 2.054601595447736 | -0.465 | -0.567 | 0.993 |
| 2.057743188101325 | -0.468 | -0.562 | 0.994 |
| 2.060884780754915 | -0.471 | -0.557 | 0.995 |
| 2.064026373408505 | -0.473 | -0.552 | 0.996 |
| 2.067167966062094 | -0.476 | -0.546 | 0.997 |
| 2.070309558715684 | -0.479 | -0.541 | 0.997 |
| 2.073451151369273 | -0.482 | -0.536 | 0.998 |
| 2.076592744022863 | -0.485 | -0.531 | 0.999 |
| 2.079734336676452 | -0.487 | -0.525 | 0.999 |
| 2.082875929330042 | -0.49 | -0.52 | 0.999 |
| 2.086017521983632 | -0.493 | -0.514 | 1 |
| 2.089159114637221 | -0.495 | -0.509 | 1 |
| 2.092300707290811 | -0.498 | -0.504 | 1 |
| 2.095442299944401 | -0.501 | -0.498 | 1 |
| 2.09858389259799 | -0.504 | -0.493 | 1 |
| 2.10172548525158 | -0.506 | -0.487 | 1 |
| 2.104867077905169 | -0.509 | -0.482 | 1 |
| 2.108008670558759 | -0.512 | -0.476 | 0.999 |
| 2.111150263212349 | -0.514 | -0.471 | 0.999 |
| 2.114291855865938 | -0.517 | -0.465 | 0.998 |
| 2.117433448519528 | -0.52 | -0.46 | 0.998 |
| 2.120575041173117 | -0.522 | -0.454 | 0.997 |
| 2.123716633826707 | -0.525 | -0.448 | 0.996 |
| 2.126858226480297 | -0.528 | -0.443 | 0.995 |
| 2.129999819133886 | -0.531 | -0.437 | 0.994 |
| 2.133141411787476 | -0.533 | -0.431 | 0.993 |
| 2.136283004441065 | -0.536 | -0.426 | 0.992 |
| 2.139424597094655 | -0.538 | -0.42 | 0.991 |
| 2.142566189748245 | -0.541 | -0.414 | 0.99 |
| 2.145707782401834 | -0.544 | -0.409 | 0.988 |
| 2.148849375055424 | -0.546 | -0.403 | 0.987 |
| 2.151990967709013 | -0.549 | -0.397 | 0.985 |
| 2.155132560362603 | -0.552 | -0.391 | 0.983 |
| 2.158274153016193 | -0.554 | -0.386 | 0.982 |
| 2.161415745669782 | -0.557 | -0.38 | 0.98 |
| 2.164557338323372 | -0.559 | -0.374 | 0.978 |
| 2.167698930976961 | -0.562 | -0.368 | 0.976 |
| 2.170840523630551 | -0.565 | -0.362 | 0.974 |
| 2.173982116284141 | -0.567 | -0.356 | 0.972 |
| 2.17712370893773 | -0.57 | -0.351 | 0.969 |
| 2.18026530159132 | -0.572 | -0.345 | 0.967 |
| 2.183406894244909 | -0.575 | -0.339 | 0.965 |
| 2.186548486898499 | -0.578 | -0.333 | 0.962 |
| 2.189690079552089 | -0.58 | -0.327 | 0.959 |
| 2.192831672205678 | -0.583 | -0.321 | 0.957 |
| 2.195973264859268 | -0.585 | -0.315 | 0.954 |
| 2.199114857512857 | -0.588 | -0.309 | 0.951 |
| 2.202256450166447 | -0.59 | -0.303 | 0.948 |
| 2.205398042820036 | -0.593 | -0.297 | 0.945 |
| 2.208539635473626 | -0.595 | -0.291 | 0.942 |
| 2.211681228127216 | -0.598 | -0.285 | 0.939 |
| 2.214822820780805 | -0.6 | -0.279 | 0.935 |
| 2.217964413434395 | -0.603 | -0.273 | 0.932 |
| 2.221106006087984 | -0.605 | -0.267 | 0.929 |
| 2.224247598741574 | -0.608 | -0.261 | 0.925 |
| 2.227389191395164 | -0.61 | -0.255 | 0.921 |
| 2.230530784048753 | -0.613 | -0.249 | 0.918 |
| 2.233672376702343 | -0.615 | -0.243 | 0.914 |
| 2.236813969355933 | -0.618 | -0.236 | 0.91 |
| 2.239955562009522 | -0.62 | -0.23 | 0.906 |
| 2.243097154663112 | -0.623 | -0.224 | 0.902 |
| 2.246238747316701 | -0.625 | -0.218 | 0.898 |
| 2.249380339970291 | -0.628 | -0.212 | 0.894 |
| 2.252521932623881 | -0.63 | -0.206 | 0.89 |
| 2.25566352527747 | -0.633 | -0.2 | 0.885 |
| 2.25880511793106 | -0.635 | -0.194 | 0.881 |
| 2.261946710584649 | -0.637 | -0.187 | 0.876 |
| 2.265088303238239 | -0.64 | -0.181 | 0.872 |
| 2.268229895891829 | -0.642 | -0.175 | 0.867 |
| 2.271371488545418 | -0.645 | -0.169 | 0.862 |
| 2.274513081199008 | -0.647 | -0.163 | 0.858 |
| 2.277654673852597 | -0.649 | -0.156 | 0.853 |
| 2.280796266506186 | -0.652 | -0.15 | 0.848 |
| 2.283937859159776 | -0.654 | -0.144 | 0.843 |
| 2.287079451813366 | -0.657 | -0.138 | 0.838 |
| 2.290221044466955 | -0.659 | -0.132 | 0.832 |
| 2.293362637120545 | -0.661 | -0.125 | 0.827 |
| 2.296504229774135 | -0.664 | -0.119 | 0.822 |
| 2.299645822427724 | -0.666 | -0.113 | 0.816 |
| 2.302787415081314 | -0.668 | -0.107 | 0.811 |
| 2.305929007734904 | -0.671 | -0.1 | 0.805 |
| 2.309070600388493 | -0.673 | -0.094 | 0.8 |
| 2.312212193042083 | -0.675 | -0.088 | 0.794 |
| 2.315353785695672 | -0.678 | -0.082 | 0.788 |
| 2.318495378349262 | -0.68 | -0.075 | 0.782 |
| 2.321636971002852 | -0.682 | -0.069 | 0.776 |
| 2.324778563656441 | -0.685 | -0.063 | 0.771 |
| 2.327920156310031 | -0.687 | -0.057 | 0.764 |
| 2.33106174896362 | -0.689 | -0.05 | 0.758 |
| 2.33420334161721 | -0.691 | -0.044 | 0.752 |
| 2.3373449342708 | -0.694 | -0.038 | 0.746 |
| 2.340486526924389 | -0.696 | -0.031 | 0.74 |
| 2.343628119577979 | -0.698 | -0.025 | 0.733 |
| 2.346769712231568 | -0.7 | -0.019 | 0.727 |
| 2.349911304885158 | -0.703 | -0.013 | 0.72 |
| 2.353052897538748 | -0.705 | -0.006 | 0.714 |
| 2.356194490192337 | -0.707 | 0 | 0.707 |
| 2.359336082845927 | -0.709 | 0.006 | 0.7 |
| 2.362477675499516 | -0.712 | 0.013 | 0.694 |
| 2.365619268153106 | -0.714 | 0.019 | 0.687 |
| 2.368760860806696 | -0.716 | 0.025 | 0.68 |
| 2.371902453460285 | -0.718 | 0.031 | 0.673 |
| 2.375044046113875 | -0.72 | 0.038 | 0.666 |
| 2.378185638767464 | -0.722 | 0.044 | 0.659 |
| 2.381327231421054 | -0.725 | 0.05 | 0.652 |
| 2.384468824074644 | -0.727 | 0.057 | 0.645 |
| 2.387610416728233 | -0.729 | 0.063 | 0.637 |
| 2.390752009381823 | -0.731 | 0.069 | 0.63 |
| 2.393893602035412 | -0.733 | 0.075 | 0.623 |
| 2.397035194689002 | -0.735 | 0.082 | 0.615 |
| 2.400176787342591 | -0.738 | 0.088 | 0.608 |
| 2.403318379996181 | -0.74 | 0.094 | 0.6 |
| 2.406459972649771 | -0.742 | 0.1 | 0.593 |
| 2.40960156530336 | -0.744 | 0.107 | 0.585 |
| 2.41274315795695 | -0.746 | 0.113 | 0.578 |
| 2.41588475061054 | -0.748 | 0.119 | 0.57 |
| 2.419026343264129 | -0.75 | 0.125 | 0.562 |
| 2.422167935917719 | -0.752 | 0.132 | 0.554 |
| 2.425309528571308 | -0.754 | 0.138 | 0.546 |
| 2.428451121224898 | -0.756 | 0.144 | 0.538 |
| 2.431592713878488 | -0.758 | 0.15 | 0.531 |
| 2.434734306532077 | -0.76 | 0.156 | 0.522 |
| 2.437875899185667 | -0.762 | 0.163 | 0.514 |
| 2.441017491839256 | -0.764 | 0.169 | 0.506 |
| 2.444159084492846 | -0.766 | 0.175 | 0.498 |
| 2.447300677146435 | -0.769 | 0.181 | 0.49 |
| 2.450442269800025 | -0.771 | 0.187 | 0.482 |
| 2.453583862453615 | -0.773 | 0.194 | 0.473 |
| 2.456725455107204 | -0.775 | 0.2 | 0.465 |
| 2.459867047760794 | -0.776 | 0.206 | 0.457 |
| 2.463008640414384 | -0.778 | 0.212 | 0.448 |
| 2.466150233067973 | -0.78 | 0.218 | 0.44 |
| 2.469291825721563 | -0.782 | 0.224 | 0.431 |
| 2.472433418375152 | -0.784 | 0.23 | 0.423 |
| 2.475575011028742 | -0.786 | 0.236 | 0.414 |
| 2.478716603682332 | -0.788 | 0.243 | 0.406 |
| 2.481858196335921 | -0.79 | 0.249 | 0.397 |
| 2.48499978898951 | -0.792 | 0.255 | 0.388 |
| 2.4881413816431 | -0.794 | 0.261 | 0.38 |
| 2.49128297429669 | -0.796 | 0.267 | 0.371 |
| 2.49442456695028 | -0.798 | 0.273 | 0.362 |
| 2.497566159603869 | -0.8 | 0.279 | 0.353 |
| 2.500707752257458 | -0.802 | 0.285 | 0.345 |
| 2.503849344911048 | -0.803 | 0.291 | 0.336 |
| 2.506990937564638 | -0.805 | 0.297 | 0.327 |
| 2.510132530218228 | -0.807 | 0.303 | 0.318 |
| 2.513274122871817 | -0.809 | 0.309 | 0.309 |
| 2.516415715525407 | -0.811 | 0.315 | 0.3 |
| 2.519557308178996 | -0.813 | 0.321 | 0.291 |
| 2.522698900832586 | -0.815 | 0.327 | 0.282 |
| 2.525840493486176 | -0.816 | 0.333 | 0.273 |
| 2.528982086139765 | -0.818 | 0.339 | 0.264 |
| 2.532123678793355 | -0.82 | 0.345 | 0.255 |
| 2.535265271446944 | -0.822 | 0.351 | 0.246 |
| 2.538406864100534 | -0.824 | 0.356 | 0.236 |
| 2.541548456754124 | -0.825 | 0.362 | 0.227 |
| 2.544690049407713 | -0.827 | 0.368 | 0.218 |
| 2.547831642061302 | -0.829 | 0.374 | 0.209 |
| 2.550973234714892 | -0.831 | 0.38 | 0.2 |
| 2.554114827368482 | -0.832 | 0.386 | 0.19 |
| 2.557256420022072 | -0.834 | 0.391 | 0.181 |
| 2.560398012675661 | -0.836 | 0.397 | 0.172 |
| 2.563539605329251 | -0.838 | 0.403 | 0.163 |
| 2.56668119798284 | -0.839 | 0.409 | 0.153 |
| 2.56982279063643 | -0.841 | 0.414 | 0.144 |
| 2.57296438329002 | -0.843 | 0.42 | 0.135 |
| 2.576105975943609 | -0.844 | 0.426 | 0.125 |
| 2.579247568597199 | -0.846 | 0.431 | 0.116 |
| 2.582389161250788 | -0.848 | 0.437 | 0.107 |
| 2.585530753904377 | -0.849 | 0.443 | 0.097 |
| 2.588672346557967 | -0.851 | 0.448 | 0.088 |
| 2.591813939211557 | -0.853 | 0.454 | 0.078 |
| 2.594955531865147 | -0.854 | 0.46 | 0.069 |
| 2.598097124518736 | -0.856 | 0.465 | 0.06 |
| 2.601238717172326 | -0.858 | 0.471 | 0.05 |
| 2.604380309825915 | -0.859 | 0.476 | 0.041 |
| 2.607521902479505 | -0.861 | 0.482 | 0.031 |
| 2.610663495133095 | -0.862 | 0.487 | 0.022 |
| 2.613805087786684 | -0.864 | 0.493 | 0.013 |
| 2.616946680440274 | -0.866 | 0.498 | 0.003 |
| 2.620088273093863 | -0.867 | 0.504 | -0.006 |
| 2.623229865747452 | -0.869 | 0.509 | -0.016 |
| 2.626371458401042 | -0.87 | 0.514 | -0.025 |
| 2.629513051054632 | -0.872 | 0.52 | -0.035 |
| 2.632654643708222 | -0.873 | 0.525 | -0.044 |
| 2.635796236361811 | -0.875 | 0.531 | -0.053 |
| 2.638937829015401 | -0.876 | 0.536 | -0.063 |
| 2.642079421668991 | -0.878 | 0.541 | -0.072 |
| 2.64522101432258 | -0.879 | 0.546 | -0.082 |
| 2.64836260697617 | -0.881 | 0.552 | -0.091 |
| 2.651504199629759 | -0.882 | 0.557 | -0.1 |
| 2.654645792283349 | -0.884 | 0.562 | -0.11 |
| 2.657787384936938 | -0.885 | 0.567 | -0.119 |
| 2.660928977590528 | -0.887 | 0.572 | -0.128 |
| 2.664070570244118 | -0.888 | 0.578 | -0.138 |
| 2.667212162897707 | -0.89 | 0.583 | -0.147 |
| 2.670353755551297 | -0.891 | 0.588 | -0.156 |
| 2.673495348204887 | -0.892 | 0.593 | -0.166 |
| 2.676636940858476 | -0.894 | 0.598 | -0.175 |
| 2.679778533512066 | -0.895 | 0.603 | -0.184 |
| 2.682920126165655 | -0.897 | 0.608 | -0.194 |
| 2.686061718819245 | -0.898 | 0.613 | -0.203 |
| 2.689203311472835 | -0.899 | 0.618 | -0.212 |
| 2.692344904126424 | -0.901 | 0.623 | -0.221 |
| 2.695486496780014 | -0.902 | 0.628 | -0.23 |
| 2.698628089433603 | -0.903 | 0.633 | -0.24 |
| 2.701769682087193 | -0.905 | 0.637 | -0.249 |
| 2.704911274740782 | -0.906 | 0.642 | -0.258 |
| 2.708052867394372 | -0.907 | 0.647 | -0.267 |
| 2.711194460047962 | -0.909 | 0.652 | -0.276 |
| 2.714336052701551 | -0.91 | 0.657 | -0.285 |
| 2.717477645355141 | -0.911 | 0.661 | -0.294 |
| 2.720619238008731 | -0.913 | 0.666 | -0.303 |
| 2.72376083066232 | -0.914 | 0.671 | -0.312 |
| 2.72690242331591 | -0.915 | 0.675 | -0.321 |
| 2.730044015969499 | -0.917 | 0.68 | -0.33 |
| 2.733185608623089 | -0.918 | 0.685 | -0.339 |
| 2.736327201276678 | -0.919 | 0.689 | -0.348 |
| 2.739468793930268 | -0.92 | 0.694 | -0.356 |
| 2.742610386583858 | -0.921 | 0.698 | -0.365 |
| 2.745751979237447 | -0.923 | 0.703 | -0.374 |
| 2.748893571891036 | -0.924 | 0.707 | -0.383 |
| 2.752035164544627 | -0.925 | 0.712 | -0.391 |
| 2.755176757198216 | -0.926 | 0.716 | -0.4 |
| 2.758318349851806 | -0.927 | 0.72 | -0.409 |
| 2.761459942505395 | -0.929 | 0.725 | -0.417 |
| 2.764601535158985 | -0.93 | 0.729 | -0.426 |
| 2.767743127812574 | -0.931 | 0.733 | -0.434 |
| 2.770884720466164 | -0.932 | 0.738 | -0.443 |
| 2.774026313119754 | -0.933 | 0.742 | -0.451 |
| 2.777167905773343 | -0.934 | 0.746 | -0.46 |
| 2.780309498426932 | -0.935 | 0.75 | -0.468 |
| 2.783451091080522 | -0.937 | 0.754 | -0.476 |
| 2.786592683734112 | -0.938 | 0.758 | -0.485 |
| 2.789734276387701 | -0.939 | 0.762 | -0.493 |
| 2.792875869041291 | -0.94 | 0.766 | -0.501 |
| 2.796017461694881 | -0.941 | 0.771 | -0.509 |
| 2.79915905434847 | -0.942 | 0.775 | -0.517 |
| 2.80230064700206 | -0.943 | 0.778 | -0.525 |
| 2.80544223965565 | -0.944 | 0.782 | -0.533 |
| 2.808583832309239 | -0.945 | 0.786 | -0.541 |
| 2.811725424962829 | -0.946 | 0.79 | -0.549 |
| 2.814867017616419 | -0.947 | 0.794 | -0.557 |
| 2.818008610270008 | -0.948 | 0.798 | -0.565 |
| 2.821150202923598 | -0.949 | 0.802 | -0.572 |
| 2.824291795577187 | -0.95 | 0.805 | -0.58 |
| 2.827433388230777 | -0.951 | 0.809 | -0.588 |
| 2.830574980884366 | -0.952 | 0.813 | -0.595 |
| 2.833716573537956 | -0.953 | 0.816 | -0.603 |
| 2.836858166191546 | -0.954 | 0.82 | -0.61 |
| 2.839999758845135 | -0.955 | 0.824 | -0.618 |
| 2.843141351498725 | -0.956 | 0.827 | -0.625 |
| 2.846282944152314 | -0.957 | 0.831 | -0.633 |
| 2.849424536805904 | -0.958 | 0.834 | -0.64 |
| 2.852566129459494 | -0.959 | 0.838 | -0.647 |
| 2.855707722113083 | -0.959 | 0.841 | -0.654 |
| 2.858849314766673 | -0.96 | 0.844 | -0.661 |
| 2.861990907420262 | -0.961 | 0.848 | -0.668 |
| 2.865132500073852 | -0.962 | 0.851 | -0.675 |
| 2.868274092727442 | -0.963 | 0.854 | -0.682 |
| 2.871415685381031 | -0.964 | 0.858 | -0.689 |
| 2.874557278034621 | -0.965 | 0.861 | -0.696 |
| 2.87769887068821 | -0.965 | 0.864 | -0.703 |
| 2.8808404633418 | -0.966 | 0.867 | -0.709 |
| 2.88398205599539 | -0.967 | 0.87 | -0.716 |
| 2.88712364864898 | -0.968 | 0.873 | -0.722 |
| 2.890265241302569 | -0.969 | 0.876 | -0.729 |
| 2.893406833956158 | -0.969 | 0.879 | -0.735 |
| 2.896548426609748 | -0.97 | 0.882 | -0.742 |
| 2.899690019263338 | -0.971 | 0.885 | -0.748 |
| 2.902831611916927 | -0.972 | 0.888 | -0.754 |
| 2.905973204570517 | -0.972 | 0.891 | -0.76 |
| 2.909114797224106 | -0.973 | 0.894 | -0.766 |
| 2.912256389877696 | -0.974 | 0.897 | -0.773 |
| 2.915397982531286 | -0.975 | 0.899 | -0.778 |
| 2.918539575184875 | -0.975 | 0.902 | -0.784 |
| 2.921681167838465 | -0.976 | 0.905 | -0.79 |
| 2.924822760492054 | -0.977 | 0.907 | -0.796 |
| 2.927964353145644 | -0.977 | 0.91 | -0.802 |
| 2.931105945799234 | -0.978 | 0.913 | -0.807 |
| 2.934247538452823 | -0.979 | 0.915 | -0.813 |
| 2.937389131106413 | -0.979 | 0.918 | -0.818 |
| 2.940530723760002 | -0.98 | 0.92 | -0.824 |
| 2.943672316413592 | -0.98 | 0.923 | -0.829 |
| 2.946813909067182 | -0.981 | 0.925 | -0.834 |
| 2.949955501720771 | -0.982 | 0.927 | -0.839 |
| 2.953097094374361 | -0.982 | 0.93 | -0.844 |
| 2.95623868702795 | -0.983 | 0.932 | -0.849 |
| 2.95938027968154 | -0.983 | 0.934 | -0.854 |
| 2.96252187233513 | -0.984 | 0.937 | -0.859 |
| 2.965663464988719 | -0.985 | 0.939 | -0.864 |
| 2.968805057642309 | -0.985 | 0.941 | -0.869 |
| 2.971946650295898 | -0.986 | 0.943 | -0.873 |
| 2.975088242949488 | -0.986 | 0.945 | -0.878 |
| 2.978229835603078 | -0.987 | 0.947 | -0.882 |
| 2.981371428256667 | -0.987 | 0.949 | -0.887 |
| 2.984513020910257 | -0.988 | 0.951 | -0.891 |
| 2.987654613563846 | -0.988 | 0.953 | -0.895 |
| 2.990796206217436 | -0.989 | 0.955 | -0.899 |
| 2.993937798871025 | -0.989 | 0.957 | -0.903 |
| 2.997079391524615 | -0.99 | 0.959 | -0.907 |
| 3.000220984178205 | -0.99 | 0.96 | -0.911 |
| 3.003362576831794 | -0.99 | 0.962 | -0.915 |
| 3.006504169485384 | -0.991 | 0.964 | -0.919 |
| 3.009645762138974 | -0.991 | 0.965 | -0.923 |
| 3.012787354792563 | -0.992 | 0.967 | -0.926 |
| 3.015928947446153 | -0.992 | 0.969 | -0.93 |
| 3.019070540099742 | -0.993 | 0.97 | -0.933 |
| 3.022212132753332 | -0.993 | 0.972 | -0.937 |
| 3.025353725406922 | -0.993 | 0.973 | -0.94 |
| 3.028495318060511 | -0.994 | 0.975 | -0.943 |
| 3.031636910714101 | -0.994 | 0.976 | -0.946 |
| 3.03477850336769 | -0.994 | 0.977 | -0.949 |
| 3.03792009602128 | -0.995 | 0.979 | -0.952 |
| 3.04106168867487 | -0.995 | 0.98 | -0.955 |
| 3.04420328132846 | -0.995 | 0.981 | -0.958 |
| 3.047344873982049 | -0.996 | 0.982 | -0.96 |
| 3.050486466635638 | -0.996 | 0.983 | -0.963 |
| 3.053628059289228 | -0.996 | 0.985 | -0.965 |
| 3.056769651942818 | -0.996 | 0.986 | -0.968 |
| 3.059911244596407 | -0.997 | 0.987 | -0.97 |
| 3.063052837249997 | -0.997 | 0.988 | -0.972 |
| 3.066194429903586 | -0.997 | 0.989 | -0.975 |
| 3.069336022557176 | -0.997 | 0.99 | -0.977 |
| 3.072477615210766 | -0.998 | 0.99 | -0.979 |
| 3.075619207864355 | -0.998 | 0.991 | -0.98 |
| 3.078760800517945 | -0.998 | 0.992 | -0.982 |
| 3.081902393171534 | -0.998 | 0.993 | -0.984 |
| 3.085043985825124 | -0.998 | 0.994 | -0.986 |
| 3.088185578478713 | -0.999 | 0.994 | -0.987 |
| 3.091327171132303 | -0.999 | 0.995 | -0.989 |
| 3.094468763785893 | -0.999 | 0.996 | -0.99 |
| 3.097610356439482 | -0.999 | 0.996 | -0.991 |
| 3.100751949093072 | -0.999 | 0.997 | -0.993 |
| 3.103893541746661 | -0.999 | 0.997 | -0.994 |
| 3.107035134400251 | -0.999 | 0.998 | -0.995 |
| 3.110176727053841 | -1 | 0.998 | -0.996 |
| 3.11331831970743 | -1 | 0.998 | -0.996 |
| 3.11645991236102 | -1 | 0.999 | -0.997 |
| 3.11960150501461 | -1 | 0.999 | -0.998 |
| 3.122743097668199 | -1 | 0.999 | -0.998 |
| 3.125884690321789 | -1 | 1 | -0.999 |
| 3.129026282975378 | -1 | 1 | -0.999 |
| 3.132167875628968 | -1 | 1 | -1 |
| 3.135309468282557 | -1 | 1 | -1 |
| 3.138451060936147 | -1 | 1 | -1 |
| 3.141592653589737 | -1 | 1 | -1 |
| 3.144734246243326 | -1 | 1 | -1 |
| 3.147875838896916 | -1 | 1 | -1 |
| 3.151017431550505 | -1 | 1 | -1 |
| 3.154159024204095 | -1 | 1 | -0.999 |
| 3.157300616857685 | -1 | 1 | -0.999 |
| 3.160442209511274 | -1 | 0.999 | -0.998 |
| 3.163583802164864 | -1 | 0.999 | -0.998 |
| 3.166725394818453 | -1 | 0.999 | -0.997 |
| 3.169866987472043 | -1 | 0.998 | -0.996 |
| 3.173008580125633 | -1 | 0.998 | -0.996 |
| 3.176150172779222 | -0.999 | 0.998 | -0.995 |
| 3.179291765432812 | -0.999 | 0.997 | -0.994 |
| 3.182433358086401 | -0.999 | 0.997 | -0.993 |
| 3.185574950739991 | -0.999 | 0.996 | -0.991 |
| 3.188716543393581 | -0.999 | 0.996 | -0.99 |
| 3.19185813604717 | -0.999 | 0.995 | -0.989 |
| 3.19499972870076 | -0.999 | 0.994 | -0.987 |
| 3.198141321354349 | -0.998 | 0.994 | -0.986 |
| 3.20128291400794 | -0.998 | 0.993 | -0.984 |
| 3.204424506661528 | -0.998 | 0.992 | -0.982 |
| 3.207566099315118 | -0.998 | 0.991 | -0.98 |
| 3.210707691968708 | -0.998 | 0.99 | -0.979 |
| 3.213849284622297 | -0.997 | 0.99 | -0.977 |
| 3.216990877275887 | -0.997 | 0.989 | -0.975 |
| 3.220132469929476 | -0.997 | 0.988 | -0.972 |
| 3.223274062583066 | -0.997 | 0.987 | -0.97 |
| 3.226415655236656 | -0.996 | 0.986 | -0.968 |
| 3.229557247890245 | -0.996 | 0.985 | -0.965 |
| 3.232698840543835 | -0.996 | 0.983 | -0.963 |
| 3.235840433197425 | -0.996 | 0.982 | -0.96 |
| 3.238982025851014 | -0.995 | 0.981 | -0.958 |
| 3.242123618504604 | -0.995 | 0.98 | -0.955 |
| 3.245265211158193 | -0.995 | 0.979 | -0.952 |
| 3.248406803811783 | -0.994 | 0.977 | -0.949 |
| 3.251548396465373 | -0.994 | 0.976 | -0.946 |
| 3.254689989118962 | -0.994 | 0.975 | -0.943 |
| 3.257831581772551 | -0.993 | 0.973 | -0.94 |
| 3.260973174426141 | -0.993 | 0.972 | -0.937 |
| 3.26411476707973 | -0.993 | 0.97 | -0.933 |
| 3.267256359733321 | -0.992 | 0.969 | -0.93 |
| 3.27039795238691 | -0.992 | 0.967 | -0.926 |
| 3.2735395450405 | -0.991 | 0.965 | -0.923 |
| 3.276681137694089 | -0.991 | 0.964 | -0.919 |
| 3.279822730347679 | -0.99 | 0.962 | -0.915 |
| 3.282964323001269 | -0.99 | 0.96 | -0.911 |
| 3.286105915654858 | -0.99 | 0.959 | -0.907 |
| 3.289247508308448 | -0.989 | 0.957 | -0.903 |
| 3.292389100962037 | -0.989 | 0.955 | -0.899 |
| 3.295530693615627 | -0.988 | 0.953 | -0.895 |
| 3.298672286269217 | -0.988 | 0.951 | -0.891 |
| 3.301813878922806 | -0.987 | 0.949 | -0.887 |
| 3.304955471576396 | -0.987 | 0.947 | -0.882 |
| 3.308097064229985 | -0.986 | 0.945 | -0.878 |
| 3.311238656883575 | -0.986 | 0.943 | -0.873 |
| 3.314380249537165 | -0.985 | 0.941 | -0.869 |
| 3.317521842190754 | -0.985 | 0.939 | -0.864 |
| 3.320663434844344 | -0.984 | 0.937 | -0.859 |
| 3.323805027497933 | -0.983 | 0.934 | -0.854 |
| 3.326946620151523 | -0.983 | 0.932 | -0.849 |
| 3.330088212805113 | -0.982 | 0.93 | -0.844 |
| 3.333229805458702 | -0.982 | 0.927 | -0.839 |
| 3.336371398112292 | -0.981 | 0.925 | -0.834 |
| 3.339512990765881 | -0.98 | 0.923 | -0.829 |
| 3.342654583419471 | -0.98 | 0.92 | -0.824 |
| 3.345796176073061 | -0.979 | 0.918 | -0.818 |
| 3.34893776872665 | -0.979 | 0.915 | -0.813 |
| 3.35207936138024 | -0.978 | 0.913 | -0.807 |
| 3.355220954033829 | -0.977 | 0.91 | -0.802 |
| 3.358362546687419 | -0.977 | 0.907 | -0.796 |
| 3.361504139341009 | -0.976 | 0.905 | -0.79 |
| 3.364645731994598 | -0.975 | 0.902 | -0.784 |
| 3.367787324648188 | -0.975 | 0.899 | -0.778 |
| 3.370928917301777 | -0.974 | 0.897 | -0.773 |
| 3.374070509955367 | -0.973 | 0.894 | -0.766 |
| 3.377212102608956 | -0.972 | 0.891 | -0.76 |
| 3.380353695262546 | -0.972 | 0.888 | -0.754 |
| 3.383495287916136 | -0.971 | 0.885 | -0.748 |
| 3.386636880569725 | -0.97 | 0.882 | -0.742 |
| 3.389778473223315 | -0.969 | 0.879 | -0.735 |
| 3.392920065876904 | -0.969 | 0.876 | -0.729 |
| 3.396061658530494 | -0.968 | 0.873 | -0.722 |
| 3.399203251184084 | -0.967 | 0.87 | -0.716 |
| 3.402344843837673 | -0.966 | 0.867 | -0.709 |
| 3.405486436491263 | -0.965 | 0.864 | -0.703 |
| 3.408628029144852 | -0.965 | 0.861 | -0.696 |
| 3.411769621798442 | -0.964 | 0.858 | -0.689 |
| 3.414911214452032 | -0.963 | 0.854 | -0.682 |
| 3.418052807105621 | -0.962 | 0.851 | -0.675 |
| 3.421194399759211 | -0.961 | 0.848 | -0.668 |
| 3.4243359924128 | -0.96 | 0.844 | -0.661 |
| 3.42747758506639 | -0.959 | 0.841 | -0.654 |
| 3.43061917771998 | -0.959 | 0.838 | -0.647 |
| 3.433760770373569 | -0.958 | 0.834 | -0.64 |
| 3.436902363027159 | -0.957 | 0.831 | -0.633 |
| 3.440043955680748 | -0.956 | 0.827 | -0.625 |
| 3.443185548334338 | -0.955 | 0.824 | -0.618 |
| 3.446327140987927 | -0.954 | 0.82 | -0.61 |
| 3.449468733641517 | -0.953 | 0.816 | -0.603 |
| 3.452610326295107 | -0.952 | 0.813 | -0.595 |
| 3.455751918948696 | -0.951 | 0.809 | -0.588 |
| 3.458893511602286 | -0.95 | 0.805 | -0.58 |
| 3.462035104255876 | -0.949 | 0.802 | -0.572 |
| 3.465176696909465 | -0.948 | 0.798 | -0.565 |
| 3.468318289563055 | -0.947 | 0.794 | -0.557 |
| 3.471459882216644 | -0.946 | 0.79 | -0.549 |
| 3.474601474870234 | -0.945 | 0.786 | -0.541 |
| 3.477743067523824 | -0.944 | 0.782 | -0.533 |
| 3.480884660177413 | -0.943 | 0.778 | -0.525 |
| 3.484026252831002 | -0.942 | 0.775 | -0.517 |
| 3.487167845484592 | -0.941 | 0.771 | -0.509 |
| 3.490309438138182 | -0.94 | 0.766 | -0.501 |
| 3.493451030791772 | -0.939 | 0.762 | -0.493 |
| 3.496592623445361 | -0.938 | 0.758 | -0.485 |
| 3.499734216098951 | -0.937 | 0.754 | -0.476 |
| 3.50287580875254 | -0.935 | 0.75 | -0.468 |
| 3.50601740140613 | -0.934 | 0.746 | -0.46 |
| 3.50915899405972 | -0.933 | 0.742 | -0.451 |
| 3.512300586713309 | -0.932 | 0.738 | -0.443 |
| 3.515442179366899 | -0.931 | 0.733 | -0.434 |
| 3.518583772020488 | -0.93 | 0.729 | -0.426 |
| 3.521725364674078 | -0.929 | 0.725 | -0.417 |
| 3.524866957327668 | -0.927 | 0.72 | -0.409 |
| 3.528008549981257 | -0.926 | 0.716 | -0.4 |
| 3.531150142634847 | -0.925 | 0.712 | -0.391 |
| 3.534291735288436 | -0.924 | 0.707 | -0.383 |
| 3.537433327942026 | -0.923 | 0.703 | -0.374 |
| 3.540574920595616 | -0.921 | 0.698 | -0.365 |
| 3.543716513249205 | -0.92 | 0.694 | -0.356 |
| 3.546858105902795 | -0.919 | 0.689 | -0.348 |
| 3.549999698556384 | -0.918 | 0.685 | -0.339 |
| 3.553141291209974 | -0.917 | 0.68 | -0.33 |
| 3.556282883863564 | -0.915 | 0.675 | -0.321 |
| 3.559424476517153 | -0.914 | 0.671 | -0.312 |
| 3.562566069170743 | -0.913 | 0.666 | -0.303 |
| 3.565707661824332 | -0.911 | 0.661 | -0.294 |
| 3.568849254477922 | -0.91 | 0.657 | -0.285 |
| 3.571990847131511 | -0.909 | 0.652 | -0.276 |
| 3.575132439785101 | -0.907 | 0.647 | -0.267 |
| 3.578274032438691 | -0.906 | 0.642 | -0.258 |
| 3.58141562509228 | -0.905 | 0.637 | -0.249 |
| 3.58455721774587 | -0.903 | 0.633 | -0.24 |
| 3.58769881039946 | -0.902 | 0.628 | -0.23 |
| 3.590840403053049 | -0.901 | 0.623 | -0.221 |
| 3.593981995706639 | -0.899 | 0.618 | -0.212 |
| 3.597123588360228 | -0.898 | 0.613 | -0.203 |
| 3.600265181013818 | -0.897 | 0.608 | -0.194 |
| 3.603406773667407 | -0.895 | 0.603 | -0.184 |
| 3.606548366320997 | -0.894 | 0.598 | -0.175 |
| 3.609689958974587 | -0.892 | 0.593 | -0.166 |
| 3.612831551628176 | -0.891 | 0.588 | -0.156 |
| 3.615973144281766 | -0.89 | 0.583 | -0.147 |
| 3.619114736935355 | -0.888 | 0.578 | -0.138 |
| 3.622256329588945 | -0.887 | 0.572 | -0.128 |
| 3.625397922242534 | -0.885 | 0.567 | -0.119 |
| 3.628539514896124 | -0.884 | 0.562 | -0.11 |
| 3.631681107549714 | -0.882 | 0.557 | -0.1 |
| 3.634822700203303 | -0.881 | 0.552 | -0.091 |
| 3.637964292856893 | -0.879 | 0.546 | -0.082 |
| 3.641105885510483 | -0.878 | 0.541 | -0.072 |
| 3.644247478164072 | -0.876 | 0.536 | -0.063 |
| 3.647389070817662 | -0.875 | 0.531 | -0.053 |
| 3.650530663471251 | -0.873 | 0.525 | -0.044 |
| 3.653672256124841 | -0.872 | 0.52 | -0.035 |
| 3.656813848778431 | -0.87 | 0.514 | -0.025 |
| 3.65995544143202 | -0.869 | 0.509 | -0.016 |
| 3.66309703408561 | -0.867 | 0.504 | -0.006 |
| 3.666238626739199 | -0.866 | 0.498 | 0.003 |
| 3.66938021939279 | -0.864 | 0.493 | 0.013 |
| 3.672521812046378 | -0.862 | 0.487 | 0.022 |
| 3.675663404699968 | -0.861 | 0.482 | 0.031 |
| 3.678804997353558 | -0.859 | 0.476 | 0.041 |
| 3.681946590007147 | -0.858 | 0.471 | 0.05 |
| 3.685088182660737 | -0.856 | 0.465 | 0.06 |
| 3.688229775314326 | -0.854 | 0.46 | 0.069 |
| 3.691371367967916 | -0.853 | 0.454 | 0.078 |
| 3.694512960621506 | -0.851 | 0.448 | 0.088 |
| 3.697654553275095 | -0.849 | 0.443 | 0.097 |
| 3.700796145928685 | -0.848 | 0.437 | 0.107 |
| 3.703937738582274 | -0.846 | 0.431 | 0.116 |
| 3.707079331235864 | -0.844 | 0.426 | 0.125 |
| 3.710220923889454 | -0.843 | 0.42 | 0.135 |
| 3.713362516543043 | -0.841 | 0.414 | 0.144 |
| 3.716504109196633 | -0.839 | 0.409 | 0.153 |
| 3.719645701850223 | -0.838 | 0.403 | 0.163 |
| 3.722787294503812 | -0.836 | 0.397 | 0.172 |
| 3.725928887157402 | -0.834 | 0.391 | 0.181 |
| 3.729070479810991 | -0.832 | 0.386 | 0.19 |
| 3.732212072464581 | -0.831 | 0.38 | 0.2 |
| 3.735353665118171 | -0.829 | 0.374 | 0.209 |
| 3.73849525777176 | -0.827 | 0.368 | 0.218 |
| 3.74163685042535 | -0.825 | 0.362 | 0.227 |
| 3.744778443078939 | -0.824 | 0.356 | 0.236 |
| 3.747920035732529 | -0.822 | 0.351 | 0.246 |
| 3.751061628386119 | -0.82 | 0.345 | 0.255 |
| 3.754203221039708 | -0.818 | 0.339 | 0.264 |
| 3.757344813693298 | -0.816 | 0.333 | 0.273 |
| 3.760486406346887 | -0.815 | 0.327 | 0.282 |
| 3.763627999000477 | -0.813 | 0.321 | 0.291 |
| 3.766769591654067 | -0.811 | 0.315 | 0.3 |
| 3.769911184307656 | -0.809 | 0.309 | 0.309 |
| 3.773052776961246 | -0.807 | 0.303 | 0.318 |
| 3.776194369614835 | -0.805 | 0.297 | 0.327 |
| 3.779335962268425 | -0.803 | 0.291 | 0.336 |
| 3.782477554922014 | -0.802 | 0.285 | 0.345 |
| 3.785619147575604 | -0.8 | 0.279 | 0.353 |
| 3.788760740229193 | -0.798 | 0.273 | 0.362 |
| 3.791902332882783 | -0.796 | 0.267 | 0.371 |
| 3.795043925536373 | -0.794 | 0.261 | 0.38 |
| 3.798185518189962 | -0.792 | 0.255 | 0.388 |
| 3.801327110843552 | -0.79 | 0.249 | 0.397 |
| 3.804468703497142 | -0.788 | 0.243 | 0.406 |
| 3.807610296150731 | -0.786 | 0.236 | 0.414 |
| 3.810751888804321 | -0.784 | 0.23 | 0.423 |
| 3.813893481457911 | -0.782 | 0.224 | 0.431 |
| 3.8170350741115 | -0.78 | 0.218 | 0.44 |
| 3.82017666676509 | -0.778 | 0.212 | 0.448 |
| 3.823318259418679 | -0.776 | 0.206 | 0.457 |
| 3.826459852072269 | -0.775 | 0.2 | 0.465 |
| 3.829601444725859 | -0.773 | 0.194 | 0.473 |
| 3.832743037379448 | -0.771 | 0.187 | 0.482 |
| 3.835884630033038 | -0.769 | 0.181 | 0.49 |
| 3.839026222686627 | -0.766 | 0.175 | 0.498 |
| 3.842167815340217 | -0.764 | 0.169 | 0.506 |
| 3.845309407993807 | -0.762 | 0.163 | 0.514 |
| 3.848451000647396 | -0.76 | 0.156 | 0.522 |
| 3.851592593300986 | -0.758 | 0.15 | 0.531 |
| 3.854734185954575 | -0.756 | 0.144 | 0.538 |
| 3.857875778608165 | -0.754 | 0.138 | 0.546 |
| 3.861017371261755 | -0.752 | 0.132 | 0.554 |
| 3.864158963915344 | -0.75 | 0.125 | 0.562 |
| 3.867300556568933 | -0.748 | 0.119 | 0.57 |
| 3.870442149222523 | -0.746 | 0.113 | 0.578 |
| 3.873583741876112 | -0.744 | 0.107 | 0.585 |
| 3.876725334529703 | -0.742 | 0.1 | 0.593 |
| 3.879866927183292 | -0.74 | 0.094 | 0.6 |
| 3.883008519836882 | -0.738 | 0.088 | 0.608 |
| 3.886150112490471 | -0.735 | 0.082 | 0.615 |
| 3.889291705144061 | -0.733 | 0.075 | 0.623 |
| 3.892433297797651 | -0.731 | 0.069 | 0.63 |
| 3.89557489045124 | -0.729 | 0.063 | 0.637 |
| 3.89871648310483 | -0.727 | 0.057 | 0.645 |
| 3.901858075758419 | -0.725 | 0.05 | 0.652 |
| 3.904999668412009 | -0.722 | 0.044 | 0.659 |
| 3.908141261065598 | -0.72 | 0.038 | 0.666 |
| 3.911282853719188 | -0.718 | 0.031 | 0.673 |
| 3.914424446372778 | -0.716 | 0.025 | 0.68 |
| 3.917566039026367 | -0.714 | 0.019 | 0.687 |
| 3.920707631679957 | -0.712 | 0.013 | 0.694 |
| 3.923849224333547 | -0.709 | 0.006 | 0.7 |
| 3.926990816987136 | -0.707 | 0 | 0.707 |
| 3.930132409640726 | -0.705 | -0.006 | 0.714 |
| 3.933274002294315 | -0.703 | -0.013 | 0.72 |
| 3.936415594947905 | -0.7 | -0.019 | 0.727 |
| 3.939557187601495 | -0.698 | -0.025 | 0.733 |
| 3.942698780255084 | -0.696 | -0.031 | 0.74 |
| 3.945840372908674 | -0.694 | -0.038 | 0.746 |
| 3.948981965562263 | -0.691 | -0.044 | 0.752 |
| 3.952123558215853 | -0.689 | -0.05 | 0.758 |
| 3.955265150869442 | -0.687 | -0.057 | 0.764 |
| 3.958406743523032 | -0.685 | -0.063 | 0.771 |
| 3.961548336176622 | -0.682 | -0.069 | 0.776 |
| 3.964689928830211 | -0.68 | -0.075 | 0.782 |
| 3.967831521483801 | -0.678 | -0.082 | 0.788 |
| 3.97097311413739 | -0.675 | -0.088 | 0.794 |
| 3.97411470679098 | -0.673 | -0.094 | 0.8 |
| 3.97725629944457 | -0.671 | -0.1 | 0.805 |
| 3.98039789209816 | -0.668 | -0.107 | 0.811 |
| 3.983539484751749 | -0.666 | -0.113 | 0.816 |
| 3.986681077405338 | -0.664 | -0.119 | 0.822 |
| 3.989822670058928 | -0.661 | -0.125 | 0.827 |
| 3.992964262712517 | -0.659 | -0.132 | 0.832 |
| 3.996105855366107 | -0.657 | -0.138 | 0.838 |
| 3.999247448019697 | -0.654 | -0.144 | 0.843 |
| 4.002389040673287 | -0.652 | -0.15 | 0.848 |
| 4.005530633326877 | -0.649 | -0.156 | 0.853 |
| 4.008672225980466 | -0.647 | -0.163 | 0.858 |
| 4.011813818634056 | -0.645 | -0.169 | 0.862 |
| 4.014955411287645 | -0.642 | -0.175 | 0.867 |
| 4.018097003941234 | -0.64 | -0.181 | 0.872 |
| 4.021238596594824 | -0.637 | -0.187 | 0.876 |
| 4.024380189248414 | -0.635 | -0.194 | 0.881 |
| 4.027521781902004 | -0.633 | -0.2 | 0.885 |
| 4.030663374555593 | -0.63 | -0.206 | 0.89 |
| 4.033804967209183 | -0.628 | -0.212 | 0.894 |
| 4.036946559862773 | -0.625 | -0.218 | 0.898 |
| 4.040088152516362 | -0.623 | -0.224 | 0.902 |
| 4.043229745169951 | -0.62 | -0.23 | 0.906 |
| 4.046371337823541 | -0.618 | -0.236 | 0.91 |
| 4.049512930477131 | -0.615 | -0.243 | 0.914 |
| 4.05265452313072 | -0.613 | -0.249 | 0.918 |
| 4.05579611578431 | -0.61 | -0.255 | 0.921 |
| 4.0589377084379 | -0.608 | -0.261 | 0.925 |
| 4.062079301091489 | -0.605 | -0.267 | 0.929 |
| 4.065220893745079 | -0.603 | -0.273 | 0.932 |
| 4.068362486398668 | -0.6 | -0.279 | 0.935 |
| 4.071504079052258 | -0.598 | -0.285 | 0.939 |
| 4.074645671705848 | -0.595 | -0.291 | 0.942 |
| 4.077787264359437 | -0.593 | -0.297 | 0.945 |
| 4.080928857013027 | -0.59 | -0.303 | 0.948 |
| 4.084070449666616 | -0.588 | -0.309 | 0.951 |
| 4.087212042320206 | -0.585 | -0.315 | 0.954 |
| 4.090353634973795 | -0.583 | -0.321 | 0.957 |
| 4.093495227627385 | -0.58 | -0.327 | 0.959 |
| 4.096636820280975 | -0.578 | -0.333 | 0.962 |
| 4.099778412934564 | -0.575 | -0.339 | 0.965 |
| 4.102920005588154 | -0.572 | -0.345 | 0.967 |
| 4.106061598241744 | -0.57 | -0.351 | 0.969 |
| 4.109203190895333 | -0.567 | -0.356 | 0.972 |
| 4.112344783548923 | -0.565 | -0.362 | 0.974 |
| 4.115486376202512 | -0.562 | -0.368 | 0.976 |
| 4.118627968856102 | -0.559 | -0.374 | 0.978 |
| 4.121769561509692 | -0.557 | -0.38 | 0.98 |
| 4.124911154163281 | -0.554 | -0.386 | 0.982 |
| 4.128052746816871 | -0.552 | -0.391 | 0.983 |
| 4.13119433947046 | -0.549 | -0.397 | 0.985 |
| 4.13433593212405 | -0.546 | -0.403 | 0.987 |
| 4.13747752477764 | -0.544 | -0.409 | 0.988 |
| 4.14061911743123 | -0.541 | -0.414 | 0.99 |
| 4.143760710084818 | -0.538 | -0.42 | 0.991 |
| 4.146902302738408 | -0.536 | -0.426 | 0.992 |
| 4.150043895391998 | -0.533 | -0.431 | 0.993 |
| 4.153185488045588 | -0.531 | -0.437 | 0.994 |
| 4.156327080699177 | -0.528 | -0.443 | 0.995 |
| 4.159468673352766 | -0.525 | -0.448 | 0.996 |
| 4.162610266006356 | -0.522 | -0.454 | 0.997 |
| 4.165751858659946 | -0.52 | -0.46 | 0.998 |
| 4.168893451313535 | -0.517 | -0.465 | 0.998 |
| 4.172035043967125 | -0.514 | -0.471 | 0.999 |
| 4.175176636620715 | -0.512 | -0.476 | 0.999 |
| 4.178318229274304 | -0.509 | -0.482 | 1 |
| 4.181459821927894 | -0.506 | -0.487 | 1 |
| 4.184601414581484 | -0.504 | -0.493 | 1 |
| 4.187743007235073 | -0.501 | -0.498 | 1 |
| 4.190884599888663 | -0.498 | -0.504 | 1 |
| 4.194026192542252 | -0.495 | -0.509 | 1 |
| 4.197167785195842 | -0.493 | -0.514 | 1 |
| 4.200309377849432 | -0.49 | -0.52 | 0.999 |
| 4.203450970503021 | -0.487 | -0.525 | 0.999 |
| 4.206592563156611 | -0.485 | -0.531 | 0.999 |
| 4.2097341558102 | -0.482 | -0.536 | 0.998 |
| 4.21287574846379 | -0.479 | -0.541 | 0.997 |
| 4.21601734111738 | -0.476 | -0.546 | 0.997 |
| 4.21915893377097 | -0.473 | -0.552 | 0.996 |
| 4.222300526424559 | -0.471 | -0.557 | 0.995 |
| 4.225442119078148 | -0.468 | -0.562 | 0.994 |
| 4.228583711731738 | -0.465 | -0.567 | 0.993 |
| 4.231725304385327 | -0.462 | -0.572 | 0.992 |
| 4.234866897038917 | -0.46 | -0.578 | 0.99 |
| 4.238008489692506 | -0.457 | -0.583 | 0.989 |
| 4.241150082346096 | -0.454 | -0.588 | 0.988 |
| 4.244291674999685 | -0.451 | -0.593 | 0.986 |
| 4.247433267653276 | -0.448 | -0.598 | 0.985 |
| 4.250574860306865 | -0.446 | -0.603 | 0.983 |
| 4.253716452960455 | -0.443 | -0.608 | 0.981 |
| 4.256858045614044 | -0.44 | -0.613 | 0.979 |
| 4.259999638267634 | -0.437 | -0.618 | 0.977 |
| 4.263141230921224 | -0.434 | -0.623 | 0.975 |
| 4.266282823574813 | -0.431 | -0.628 | 0.973 |
| 4.269424416228403 | -0.429 | -0.633 | 0.971 |
| 4.272566008881992 | -0.426 | -0.637 | 0.969 |
| 4.275707601535582 | -0.423 | -0.642 | 0.966 |
| 4.27884919418917 | -0.42 | -0.647 | 0.964 |
| 4.28199078684276 | -0.417 | -0.652 | 0.961 |
| 4.285132379496351 | -0.414 | -0.657 | 0.959 |
| 4.28827397214994 | -0.412 | -0.661 | 0.956 |
| 4.29141556480353 | -0.409 | -0.666 | 0.953 |
| 4.294557157457119 | -0.406 | -0.671 | 0.95 |
| 4.29769875011071 | -0.403 | -0.675 | 0.947 |
| 4.300840342764299 | -0.4 | -0.68 | 0.944 |
| 4.303981935417888 | -0.397 | -0.685 | 0.941 |
| 4.307123528071478 | -0.394 | -0.689 | 0.938 |
| 4.310265120725067 | -0.391 | -0.694 | 0.934 |
| 4.313406713378657 | -0.388 | -0.698 | 0.931 |
| 4.316548306032247 | -0.386 | -0.703 | 0.927 |
| 4.319689898685836 | -0.383 | -0.707 | 0.924 |
| 4.322831491339426 | -0.38 | -0.712 | 0.92 |
| 4.325973083993015 | -0.377 | -0.716 | 0.917 |
| 4.329114676646605 | -0.374 | -0.72 | 0.913 |
| 4.332256269300195 | -0.371 | -0.725 | 0.909 |
| 4.335397861953784 | -0.368 | -0.729 | 0.905 |
| 4.338539454607374 | -0.365 | -0.733 | 0.901 |
| 4.341681047260963 | -0.362 | -0.738 | 0.897 |
| 4.344822639914553 | -0.359 | -0.742 | 0.892 |
| 4.347964232568143 | -0.356 | -0.746 | 0.888 |
| 4.351105825221732 | -0.353 | -0.75 | 0.884 |
| 4.354247417875322 | -0.351 | -0.754 | 0.879 |
| 4.357389010528911 | -0.348 | -0.758 | 0.875 |
| 4.360530603182501 | -0.345 | -0.762 | 0.87 |
| 4.36367219583609 | -0.342 | -0.766 | 0.866 |
| 4.36681378848968 | -0.339 | -0.771 | 0.861 |
| 4.36995538114327 | -0.336 | -0.775 | 0.856 |
| 4.373096973796859 | -0.333 | -0.778 | 0.851 |
| 4.376238566450449 | -0.33 | -0.782 | 0.846 |
| 4.379380159104038 | -0.327 | -0.786 | 0.841 |
| 4.382521751757628 | -0.324 | -0.79 | 0.836 |
| 4.385663344411217 | -0.321 | -0.794 | 0.831 |
| 4.388804937064807 | -0.318 | -0.798 | 0.825 |
| 4.391946529718397 | -0.315 | -0.802 | 0.82 |
| 4.395088122371987 | -0.312 | -0.805 | 0.815 |
| 4.398229715025576 | -0.309 | -0.809 | 0.809 |
| 4.401371307679165 | -0.306 | -0.813 | 0.803 |
| 4.404512900332755 | -0.303 | -0.816 | 0.798 |
| 4.407654492986345 | -0.3 | -0.82 | 0.792 |
| 4.410796085639934 | -0.297 | -0.824 | 0.786 |
| 4.413937678293524 | -0.294 | -0.827 | 0.78 |
| 4.417079270947114 | -0.291 | -0.831 | 0.775 |
| 4.420220863600703 | -0.288 | -0.834 | 0.769 |
| 4.423362456254293 | -0.285 | -0.838 | 0.762 |
| 4.426504048907883 | -0.282 | -0.841 | 0.756 |
| 4.429645641561472 | -0.279 | -0.844 | 0.75 |
| 4.432787234215062 | -0.276 | -0.848 | 0.744 |
| 4.435928826868651 | -0.273 | -0.851 | 0.738 |
| 4.43907041952224 | -0.27 | -0.854 | 0.731 |
| 4.44221201217583 | -0.267 | -0.858 | 0.725 |
| 4.44535360482942 | -0.264 | -0.861 | 0.718 |
| 4.44849519748301 | -0.261 | -0.864 | 0.712 |
| 4.4516367901366 | -0.258 | -0.867 | 0.705 |
| 4.454778382790188 | -0.255 | -0.87 | 0.698 |
| 4.457919975443779 | -0.252 | -0.873 | 0.691 |
| 4.461061568097368 | -0.249 | -0.876 | 0.685 |
| 4.464203160750958 | -0.246 | -0.879 | 0.678 |
| 4.467344753404547 | -0.243 | -0.882 | 0.671 |
| 4.470486346058137 | -0.24 | -0.885 | 0.664 |
| 4.473627938711726 | -0.236 | -0.888 | 0.657 |
| 4.476769531365316 | -0.233 | -0.891 | 0.649 |
| 4.479911124018905 | -0.23 | -0.894 | 0.642 |
| 4.483052716672495 | -0.227 | -0.897 | 0.635 |
| 4.486194309326085 | -0.224 | -0.899 | 0.628 |
| 4.489335901979674 | -0.221 | -0.902 | 0.62 |
| 4.492477494633264 | -0.218 | -0.905 | 0.613 |
| 4.495619087286854 | -0.215 | -0.907 | 0.605 |
| 4.498760679940443 | -0.212 | -0.91 | 0.598 |
| 4.501902272594033 | -0.209 | -0.913 | 0.59 |
| 4.505043865247622 | -0.206 | -0.915 | 0.583 |
| 4.508185457901212 | -0.203 | -0.918 | 0.575 |
| 4.511327050554801 | -0.2 | -0.92 | 0.567 |
| 4.514468643208391 | -0.197 | -0.923 | 0.559 |
| 4.517610235861981 | -0.194 | -0.925 | 0.552 |
| 4.520751828515571 | -0.19 | -0.927 | 0.544 |
| 4.52389342116916 | -0.187 | -0.93 | 0.536 |
| 4.52703501382275 | -0.184 | -0.932 | 0.528 |
| 4.530176606476339 | -0.181 | -0.934 | 0.52 |
| 4.533318199129928 | -0.178 | -0.937 | 0.512 |
| 4.536459791783518 | -0.175 | -0.939 | 0.504 |
| 4.539601384437108 | -0.172 | -0.941 | 0.495 |
| 4.542742977090698 | -0.169 | -0.943 | 0.487 |
| 4.545884569744287 | -0.166 | -0.945 | 0.479 |
| 4.549026162397876 | -0.163 | -0.947 | 0.471 |
| 4.552167755051466 | -0.16 | -0.949 | 0.462 |
| 4.555309347705056 | -0.156 | -0.951 | 0.454 |
| 4.558450940358646 | -0.153 | -0.953 | 0.446 |
| 4.561592533012235 | -0.15 | -0.955 | 0.437 |
| 4.564734125665825 | -0.147 | -0.957 | 0.429 |
| 4.567875718319415 | -0.144 | -0.959 | 0.42 |
| 4.571017310973004 | -0.141 | -0.96 | 0.412 |
| 4.574158903626594 | -0.138 | -0.962 | 0.403 |
| 4.577300496280183 | -0.135 | -0.964 | 0.394 |
| 4.580442088933772 | -0.132 | -0.965 | 0.386 |
| 4.583583681587362 | -0.128 | -0.967 | 0.377 |
| 4.586725274240952 | -0.125 | -0.969 | 0.368 |
| 4.589866866894542 | -0.122 | -0.97 | 0.359 |
| 4.593008459548131 | -0.119 | -0.972 | 0.351 |
| 4.596150052201721 | -0.116 | -0.973 | 0.342 |
| 4.59929164485531 | -0.113 | -0.975 | 0.333 |
| 4.6024332375089 | -0.11 | -0.976 | 0.324 |
| 4.60557483016249 | -0.107 | -0.977 | 0.315 |
| 4.608716422816079 | -0.103 | -0.979 | 0.306 |
| 4.611858015469668 | -0.1 | -0.98 | 0.297 |
| 4.614999608123258 | -0.097 | -0.981 | 0.288 |
| 4.618141200776848 | -0.094 | -0.982 | 0.279 |
| 4.621282793430437 | -0.091 | -0.983 | 0.27 |
| 4.624424386084027 | -0.088 | -0.985 | 0.261 |
| 4.627565978737617 | -0.085 | -0.986 | 0.252 |
| 4.630707571391206 | -0.082 | -0.987 | 0.243 |
| 4.633849164044795 | -0.078 | -0.988 | 0.233 |
| 4.636990756698386 | -0.075 | -0.989 | 0.224 |
| 4.640132349351975 | -0.072 | -0.99 | 0.215 |
| 4.643273942005564 | -0.069 | -0.99 | 0.206 |
| 4.646415534659154 | -0.066 | -0.991 | 0.197 |
| 4.649557127312744 | -0.063 | -0.992 | 0.187 |
| 4.652698719966334 | -0.06 | -0.993 | 0.178 |
| 4.655840312619923 | -0.057 | -0.994 | 0.169 |
| 4.658981905273513 | -0.053 | -0.994 | 0.16 |
| 4.662123497927102 | -0.05 | -0.995 | 0.15 |
| 4.665265090580692 | -0.047 | -0.996 | 0.141 |
| 4.668406683234282 | -0.044 | -0.996 | 0.132 |
| 4.671548275887871 | -0.041 | -0.997 | 0.122 |
| 4.674689868541461 | -0.038 | -0.997 | 0.113 |
| 4.67783146119505 | -0.035 | -0.998 | 0.103 |
| 4.68097305384864 | -0.031 | -0.998 | 0.094 |
| 4.68411464650223 | -0.028 | -0.998 | 0.085 |
| 4.687256239155819 | -0.025 | -0.999 | 0.075 |
| 4.690397831809409 | -0.022 | -0.999 | 0.066 |
| 4.693539424462998 | -0.019 | -0.999 | 0.057 |
| 4.696681017116588 | -0.016 | -1 | 0.047 |
| 4.699822609770177 | -0.013 | -1 | 0.038 |
| 4.702964202423767 | -0.009 | -1 | 0.028 |
| 4.706105795077356 | -0.006 | -1 | 0.019 |
| 4.709247387730946 | -0.003 | -1 | 0.009 |
| 4.712388980384535 | 0 | -1 | 0 |
| 4.715530573038126 | 0.003 | -1 | -0.009 |
| 4.718672165691715 | 0.006 | -1 | -0.019 |
| 4.721813758345305 | 0.009 | -1 | -0.028 |
| 4.724955350998894 | 0.013 | -1 | -0.038 |
| 4.728096943652484 | 0.016 | -1 | -0.047 |
| 4.731238536306074 | 0.019 | -0.999 | -0.057 |
| 4.734380128959663 | 0.022 | -0.999 | -0.066 |
| 4.737521721613253 | 0.025 | -0.999 | -0.075 |
| 4.740663314266842 | 0.028 | -0.998 | -0.085 |
| 4.743804906920432 | 0.031 | -0.998 | -0.094 |
| 4.74694649957402 | 0.035 | -0.998 | -0.103 |
| 4.750088092227611 | 0.038 | -0.997 | -0.113 |
| 4.7532296848812 | 0.041 | -0.997 | -0.122 |
| 4.75637127753479 | 0.044 | -0.996 | -0.132 |
| 4.75951287018838 | 0.047 | -0.996 | -0.141 |
| 4.76265446284197 | 0.05 | -0.995 | -0.15 |
| 4.765796055495559 | 0.053 | -0.994 | -0.16 |
| 4.768937648149149 | 0.057 | -0.994 | -0.169 |
| 4.772079240802738 | 0.06 | -0.993 | -0.178 |
| 4.775220833456327 | 0.063 | -0.992 | -0.187 |
| 4.778362426109917 | 0.066 | -0.991 | -0.197 |
| 4.781504018763507 | 0.069 | -0.99 | -0.206 |
| 4.784645611417097 | 0.072 | -0.99 | -0.215 |
| 4.787787204070686 | 0.075 | -0.989 | -0.224 |
| 4.790928796724275 | 0.078 | -0.988 | -0.233 |
| 4.794070389377865 | 0.082 | -0.987 | -0.243 |
| 4.797211982031455 | 0.085 | -0.986 | -0.252 |
| 4.800353574685045 | 0.088 | -0.985 | -0.261 |
| 4.803495167338634 | 0.091 | -0.983 | -0.27 |
| 4.806636759992224 | 0.094 | -0.982 | -0.279 |
| 4.809778352645814 | 0.097 | -0.981 | -0.288 |
| 4.812919945299403 | 0.1 | -0.98 | -0.297 |
| 4.816061537952993 | 0.103 | -0.979 | -0.306 |
| 4.819203130606582 | 0.107 | -0.977 | -0.315 |
| 4.822344723260172 | 0.11 | -0.976 | -0.324 |
| 4.825486315913761 | 0.113 | -0.975 | -0.333 |
| 4.828627908567351 | 0.116 | -0.973 | -0.342 |
| 4.83176950122094 | 0.119 | -0.972 | -0.351 |
| 4.83491109387453 | 0.122 | -0.97 | -0.359 |
| 4.83805268652812 | 0.125 | -0.969 | -0.368 |
| 4.841194279181709 | 0.128 | -0.967 | -0.377 |
| 4.844335871835299 | 0.132 | -0.965 | -0.386 |
| 4.847477464488889 | 0.135 | -0.964 | -0.394 |
| 4.850619057142478 | 0.138 | -0.962 | -0.403 |
| 4.853760649796068 | 0.141 | -0.96 | -0.412 |
| 4.856902242449657 | 0.144 | -0.959 | -0.42 |
| 4.860043835103247 | 0.147 | -0.957 | -0.429 |
| 4.863185427756837 | 0.15 | -0.955 | -0.437 |
| 4.866327020410426 | 0.153 | -0.953 | -0.446 |
| 4.869468613064015 | 0.156 | -0.951 | -0.454 |
| 4.872610205717605 | 0.16 | -0.949 | -0.462 |
| 4.875751798371195 | 0.163 | -0.947 | -0.471 |
| 4.878893391024784 | 0.166 | -0.945 | -0.479 |
| 4.882034983678374 | 0.169 | -0.943 | -0.487 |
| 4.885176576331964 | 0.172 | -0.941 | -0.495 |
| 4.888318168985553 | 0.175 | -0.939 | -0.504 |
| 4.891459761639143 | 0.178 | -0.937 | -0.512 |
| 4.894601354292733 | 0.181 | -0.934 | -0.52 |
| 4.897742946946322 | 0.184 | -0.932 | -0.528 |
| 4.900884539599912 | 0.187 | -0.93 | -0.536 |
| 4.904026132253501 | 0.19 | -0.927 | -0.544 |
| 4.907167724907091 | 0.194 | -0.925 | -0.552 |
| 4.91030931756068 | 0.197 | -0.923 | -0.559 |
| 4.91345091021427 | 0.2 | -0.92 | -0.567 |
| 4.91659250286786 | 0.203 | -0.918 | -0.575 |
| 4.91973409552145 | 0.206 | -0.915 | -0.583 |
| 4.922875688175039 | 0.209 | -0.913 | -0.59 |
| 4.926017280828628 | 0.212 | -0.91 | -0.598 |
| 4.929158873482218 | 0.215 | -0.907 | -0.605 |
| 4.932300466135808 | 0.218 | -0.905 | -0.613 |
| 4.935442058789397 | 0.221 | -0.902 | -0.62 |
| 4.938583651442987 | 0.224 | -0.899 | -0.628 |
| 4.941725244096576 | 0.227 | -0.897 | -0.635 |
| 4.944866836750166 | 0.23 | -0.894 | -0.642 |
| 4.948008429403755 | 0.233 | -0.891 | -0.649 |
| 4.951150022057345 | 0.236 | -0.888 | -0.657 |
| 4.954291614710935 | 0.24 | -0.885 | -0.664 |
| 4.957433207364524 | 0.243 | -0.882 | -0.671 |
| 4.960574800018114 | 0.246 | -0.879 | -0.678 |
| 4.963716392671704 | 0.249 | -0.876 | -0.685 |
| 4.966857985325293 | 0.252 | -0.873 | -0.691 |
| 4.969999577978883 | 0.255 | -0.87 | -0.698 |
| 4.973141170632472 | 0.258 | -0.867 | -0.705 |
| 4.976282763286062 | 0.261 | -0.864 | -0.712 |
| 4.979424355939651 | 0.264 | -0.861 | -0.718 |
| 4.982565948593241 | 0.267 | -0.858 | -0.725 |
| 4.985707541246831 | 0.27 | -0.854 | -0.731 |
| 4.98884913390042 | 0.273 | -0.851 | -0.738 |
| 4.99199072655401 | 0.276 | -0.848 | -0.744 |
| 4.9951323192076 | 0.279 | -0.844 | -0.75 |
| 4.99827391186119 | 0.282 | -0.841 | -0.756 |
| 5.00141550451478 | 0.285 | -0.838 | -0.762 |
| 5.004557097168369 | 0.288 | -0.834 | -0.769 |
| 5.007698689821958 | 0.291 | -0.831 | -0.775 |
| 5.010840282475548 | 0.294 | -0.827 | -0.78 |
| 5.013981875129137 | 0.297 | -0.824 | -0.786 |
| 5.017123467782727 | 0.3 | -0.82 | -0.792 |
| 5.020265060436317 | 0.303 | -0.816 | -0.798 |
| 5.023406653089906 | 0.306 | -0.813 | -0.803 |
| 5.026548245743496 | 0.309 | -0.809 | -0.809 |
| 5.029689838397085 | 0.312 | -0.805 | -0.815 |
| 5.032831431050674 | 0.315 | -0.802 | -0.82 |
| 5.035973023704264 | 0.318 | -0.798 | -0.825 |
| 5.039114616357854 | 0.321 | -0.794 | -0.831 |
| 5.042256209011444 | 0.324 | -0.79 | -0.836 |
| 5.045397801665033 | 0.327 | -0.786 | -0.841 |
| 5.048539394318622 | 0.33 | -0.782 | -0.846 |
| 5.051680986972213 | 0.333 | -0.778 | -0.851 |
| 5.054822579625802 | 0.336 | -0.775 | -0.856 |
| 5.057964172279392 | 0.339 | -0.771 | -0.861 |
| 5.061105764932981 | 0.342 | -0.766 | -0.866 |
| 5.064247357586571 | 0.345 | -0.762 | -0.87 |
| 5.067388950240161 | 0.348 | -0.758 | -0.875 |
| 5.07053054289375 | 0.351 | -0.754 | -0.879 |
| 5.07367213554734 | 0.353 | -0.75 | -0.884 |
| 5.07681372820093 | 0.356 | -0.746 | -0.888 |
| 5.079955320854519 | 0.359 | -0.742 | -0.892 |
| 5.083096913508108 | 0.362 | -0.738 | -0.897 |
| 5.086238506161698 | 0.365 | -0.733 | -0.901 |
| 5.089380098815288 | 0.368 | -0.729 | -0.905 |
| 5.092521691468877 | 0.371 | -0.725 | -0.909 |
| 5.095663284122466 | 0.374 | -0.72 | -0.913 |
| 5.098804876776057 | 0.377 | -0.716 | -0.917 |
| 5.101946469429646 | 0.38 | -0.712 | -0.92 |
| 5.105088062083236 | 0.383 | -0.707 | -0.924 |
| 5.108229654736825 | 0.386 | -0.703 | -0.927 |
| 5.111371247390415 | 0.388 | -0.698 | -0.931 |
| 5.114512840044005 | 0.391 | -0.694 | -0.934 |
| 5.117654432697594 | 0.394 | -0.689 | -0.938 |
| 5.120796025351184 | 0.397 | -0.685 | -0.941 |
| 5.123937618004773 | 0.4 | -0.68 | -0.944 |
| 5.127079210658363 | 0.403 | -0.675 | -0.947 |
| 5.130220803311953 | 0.406 | -0.671 | -0.95 |
| 5.133362395965542 | 0.409 | -0.666 | -0.953 |
| 5.136503988619131 | 0.412 | -0.661 | -0.956 |
| 5.13964558127272 | 0.414 | -0.657 | -0.959 |
| 5.142787173926311 | 0.417 | -0.652 | -0.961 |
| 5.1459287665799 | 0.42 | -0.647 | -0.964 |
| 5.14907035923349 | 0.423 | -0.642 | -0.966 |
| 5.15221195188708 | 0.426 | -0.637 | -0.969 |
| 5.15535354454067 | 0.429 | -0.633 | -0.971 |
| 5.158495137194259 | 0.431 | -0.628 | -0.973 |
| 5.161636729847848 | 0.434 | -0.623 | -0.975 |
| 5.164778322501438 | 0.437 | -0.618 | -0.977 |
| 5.167919915155028 | 0.44 | -0.613 | -0.979 |
| 5.171061507808617 | 0.443 | -0.608 | -0.981 |
| 5.174203100462206 | 0.446 | -0.603 | -0.983 |
| 5.177344693115796 | 0.448 | -0.598 | -0.985 |
| 5.180486285769386 | 0.451 | -0.593 | -0.986 |
| 5.183627878422976 | 0.454 | -0.588 | -0.988 |
| 5.186769471076565 | 0.457 | -0.583 | -0.989 |
| 5.189911063730155 | 0.46 | -0.578 | -0.99 |
| 5.193052656383744 | 0.462 | -0.572 | -0.992 |
| 5.196194249037334 | 0.465 | -0.567 | -0.993 |
| 5.199335841690924 | 0.468 | -0.562 | -0.994 |
| 5.202477434344513 | 0.471 | -0.557 | -0.995 |
| 5.205619026998103 | 0.473 | -0.552 | -0.996 |
| 5.208760619651692 | 0.476 | -0.546 | -0.997 |
| 5.211902212305282 | 0.479 | -0.541 | -0.997 |
| 5.215043804958871 | 0.482 | -0.536 | -0.998 |
| 5.218185397612461 | 0.485 | -0.531 | -0.999 |
| 5.221326990266051 | 0.487 | -0.525 | -0.999 |
| 5.22446858291964 | 0.49 | -0.52 | -0.999 |
| 5.22761017557323 | 0.493 | -0.514 | -1 |
| 5.23075176822682 | 0.495 | -0.509 | -1 |
| 5.23389336088041 | 0.498 | -0.504 | -1 |
| 5.237034953533999 | 0.501 | -0.498 | -1 |
| 5.240176546187588 | 0.504 | -0.493 | -1 |
| 5.243318138841178 | 0.506 | -0.487 | -1 |
| 5.246459731494767 | 0.509 | -0.482 | -1 |
| 5.249601324148357 | 0.512 | -0.476 | -0.999 |
| 5.252742916801947 | 0.514 | -0.471 | -0.999 |
| 5.255884509455536 | 0.517 | -0.465 | -0.998 |
| 5.259026102109125 | 0.52 | -0.46 | -0.998 |
| 5.262167694762715 | 0.522 | -0.454 | -0.997 |
| 5.265309287416305 | 0.525 | -0.448 | -0.996 |
| 5.268450880069895 | 0.528 | -0.443 | -0.995 |
| 5.271592472723484 | 0.531 | -0.437 | -0.994 |
| 5.274734065377074 | 0.533 | -0.431 | -0.993 |
| 5.277875658030664 | 0.536 | -0.426 | -0.992 |
| 5.281017250684253 | 0.538 | -0.42 | -0.991 |
| 5.284158843337843 | 0.541 | -0.414 | -0.99 |
| 5.287300435991432 | 0.544 | -0.409 | -0.988 |
| 5.290442028645022 | 0.546 | -0.403 | -0.987 |
| 5.293583621298612 | 0.549 | -0.397 | -0.985 |
| 5.296725213952201 | 0.552 | -0.391 | -0.983 |
| 5.299866806605791 | 0.554 | -0.386 | -0.982 |
| 5.30300839925938 | 0.557 | -0.38 | -0.98 |
| 5.30614999191297 | 0.559 | -0.374 | -0.978 |
| 5.30929158456656 | 0.562 | -0.368 | -0.976 |
| 5.312433177220149 | 0.565 | -0.362 | -0.974 |
| 5.315574769873739 | 0.567 | -0.356 | -0.972 |
| 5.318716362527328 | 0.57 | -0.351 | -0.969 |
| 5.321857955180918 | 0.572 | -0.345 | -0.967 |
| 5.324999547834508 | 0.575 | -0.339 | -0.965 |
| 5.328141140488097 | 0.578 | -0.333 | -0.962 |
| 5.331282733141686 | 0.58 | -0.327 | -0.959 |
| 5.334424325795276 | 0.583 | -0.321 | -0.957 |
| 5.337565918448866 | 0.585 | -0.315 | -0.954 |
| 5.340707511102456 | 0.588 | -0.309 | -0.951 |
| 5.343849103756045 | 0.59 | -0.303 | -0.948 |
| 5.346990696409634 | 0.593 | -0.297 | -0.945 |
| 5.350132289063224 | 0.595 | -0.291 | -0.942 |
| 5.353273881716814 | 0.598 | -0.285 | -0.939 |
| 5.356415474370403 | 0.6 | -0.279 | -0.935 |
| 5.359557067023993 | 0.603 | -0.273 | -0.932 |
| 5.362698659677583 | 0.605 | -0.267 | -0.929 |
| 5.365840252331172 | 0.608 | -0.261 | -0.925 |
| 5.368981844984762 | 0.61 | -0.255 | -0.921 |
| 5.372123437638351 | 0.613 | -0.249 | -0.918 |
| 5.375265030291941 | 0.615 | -0.243 | -0.914 |
| 5.378406622945531 | 0.618 | -0.236 | -0.91 |
| 5.38154821559912 | 0.62 | -0.23 | -0.906 |
| 5.38468980825271 | 0.623 | -0.224 | -0.902 |
| 5.387831400906299 | 0.625 | -0.218 | -0.898 |
| 5.39097299355989 | 0.628 | -0.212 | -0.894 |
| 5.394114586213479 | 0.63 | -0.206 | -0.89 |
| 5.397256178867068 | 0.633 | -0.2 | -0.885 |
| 5.400397771520657 | 0.635 | -0.194 | -0.881 |
| 5.403539364174247 | 0.637 | -0.187 | -0.876 |
| 5.406680956827837 | 0.64 | -0.181 | -0.872 |
| 5.409822549481426 | 0.642 | -0.175 | -0.867 |
| 5.412964142135016 | 0.645 | -0.169 | -0.862 |
| 5.416105734788605 | 0.647 | -0.163 | -0.858 |
| 5.419247327442195 | 0.649 | -0.156 | -0.853 |
| 5.422388920095785 | 0.652 | -0.15 | -0.848 |
| 5.425530512749375 | 0.654 | -0.144 | -0.843 |
| 5.428672105402964 | 0.657 | -0.138 | -0.838 |
| 5.431813698056554 | 0.659 | -0.132 | -0.832 |
| 5.434955290710143 | 0.661 | -0.125 | -0.827 |
| 5.438096883363733 | 0.664 | -0.119 | -0.822 |
| 5.441238476017322 | 0.666 | -0.113 | -0.816 |
| 5.444380068670912 | 0.668 | -0.107 | -0.811 |
| 5.447521661324502 | 0.671 | -0.1 | -0.805 |
| 5.450663253978091 | 0.673 | -0.094 | -0.8 |
| 5.453804846631681 | 0.675 | -0.088 | -0.794 |
| 5.456946439285271 | 0.678 | -0.082 | -0.788 |
| 5.46008803193886 | 0.68 | -0.075 | -0.782 |
| 5.46322962459245 | 0.682 | -0.069 | -0.776 |
| 5.466371217246039 | 0.685 | -0.063 | -0.771 |
| 5.46951280989963 | 0.687 | -0.057 | -0.764 |
| 5.472654402553218 | 0.689 | -0.05 | -0.758 |
| 5.475795995206808 | 0.691 | -0.044 | -0.752 |
| 5.478937587860398 | 0.694 | -0.038 | -0.746 |
| 5.482079180513987 | 0.696 | -0.031 | -0.74 |
| 5.485220773167577 | 0.698 | -0.025 | -0.733 |
| 5.488362365821166 | 0.7 | -0.019 | -0.727 |
| 5.491503958474756 | 0.703 | -0.013 | -0.72 |
| 5.494645551128346 | 0.705 | -0.006 | -0.714 |
| 5.497787143781935 | 0.707 | 0 | -0.707 |
| 5.500928736435525 | 0.709 | 0.006 | -0.7 |
| 5.504070329089115 | 0.712 | 0.013 | -0.694 |
| 5.507211921742704 | 0.714 | 0.019 | -0.687 |
| 5.510353514396294 | 0.716 | 0.025 | -0.68 |
| 5.513495107049883 | 0.718 | 0.031 | -0.673 |
| 5.516636699703473 | 0.72 | 0.038 | -0.666 |
| 5.519778292357062 | 0.722 | 0.044 | -0.659 |
| 5.522919885010652 | 0.725 | 0.05 | -0.652 |
| 5.526061477664242 | 0.727 | 0.057 | -0.645 |
| 5.529203070317831 | 0.729 | 0.063 | -0.637 |
| 5.532344662971421 | 0.731 | 0.069 | -0.63 |
| 5.535486255625011 | 0.733 | 0.075 | -0.623 |
| 5.5386278482786 | 0.735 | 0.082 | -0.615 |
| 5.54176944093219 | 0.738 | 0.088 | -0.608 |
| 5.544911033585779 | 0.74 | 0.094 | -0.6 |
| 5.54805262623937 | 0.742 | 0.1 | -0.593 |
| 5.551194218892959 | 0.744 | 0.107 | -0.585 |
| 5.554335811546548 | 0.746 | 0.113 | -0.578 |
| 5.557477404200137 | 0.748 | 0.119 | -0.57 |
| 5.560618996853727 | 0.75 | 0.125 | -0.562 |
| 5.563760589507317 | 0.752 | 0.132 | -0.554 |
| 5.566902182160906 | 0.754 | 0.138 | -0.546 |
| 5.570043774814496 | 0.756 | 0.144 | -0.538 |
| 5.573185367468086 | 0.758 | 0.15 | -0.531 |
| 5.576326960121675 | 0.76 | 0.156 | -0.522 |
| 5.579468552775264 | 0.762 | 0.163 | -0.514 |
| 5.582610145428854 | 0.764 | 0.169 | -0.506 |
| 5.585751738082444 | 0.766 | 0.175 | -0.498 |
| 5.588893330736034 | 0.769 | 0.181 | -0.49 |
| 5.592034923389623 | 0.771 | 0.187 | -0.482 |
| 5.595176516043213 | 0.773 | 0.194 | -0.473 |
| 5.598318108696803 | 0.775 | 0.2 | -0.465 |
| 5.601459701350392 | 0.776 | 0.206 | -0.457 |
| 5.604601294003982 | 0.778 | 0.212 | -0.448 |
| 5.607742886657571 | 0.78 | 0.218 | -0.44 |
| 5.610884479311161 | 0.782 | 0.224 | -0.431 |
| 5.61402607196475 | 0.784 | 0.23 | -0.423 |
| 5.61716766461834 | 0.786 | 0.236 | -0.414 |
| 5.62030925727193 | 0.788 | 0.243 | -0.406 |
| 5.623450849925519 | 0.79 | 0.249 | -0.397 |
| 5.626592442579109 | 0.792 | 0.255 | -0.388 |
| 5.629734035232698 | 0.794 | 0.261 | -0.38 |
| 5.632875627886288 | 0.796 | 0.267 | -0.371 |
| 5.636017220539878 | 0.798 | 0.273 | -0.362 |
| 5.639158813193467 | 0.8 | 0.279 | -0.353 |
| 5.642300405847057 | 0.802 | 0.285 | -0.345 |
| 5.645441998500646 | 0.803 | 0.291 | -0.336 |
| 5.648583591154236 | 0.805 | 0.297 | -0.327 |
| 5.651725183807825 | 0.807 | 0.303 | -0.318 |
| 5.654866776461415 | 0.809 | 0.309 | -0.309 |
| 5.658008369115005 | 0.811 | 0.315 | -0.3 |
| 5.661149961768594 | 0.813 | 0.321 | -0.291 |
| 5.664291554422184 | 0.815 | 0.327 | -0.282 |
| 5.667433147075774 | 0.816 | 0.333 | -0.273 |
| 5.670574739729363 | 0.818 | 0.339 | -0.264 |
| 5.673716332382953 | 0.82 | 0.345 | -0.255 |
| 5.676857925036542 | 0.822 | 0.351 | -0.246 |
| 5.679999517690132 | 0.824 | 0.356 | -0.236 |
| 5.683141110343721 | 0.825 | 0.362 | -0.227 |
| 5.686282702997311 | 0.827 | 0.368 | -0.218 |
| 5.689424295650901 | 0.829 | 0.374 | -0.209 |
| 5.69256588830449 | 0.831 | 0.38 | -0.2 |
| 5.69570748095808 | 0.832 | 0.386 | -0.19 |
| 5.69884907361167 | 0.834 | 0.391 | -0.181 |
| 5.701990666265259 | 0.836 | 0.397 | -0.172 |
| 5.705132258918849 | 0.838 | 0.403 | -0.163 |
| 5.708273851572438 | 0.839 | 0.409 | -0.153 |
| 5.711415444226028 | 0.841 | 0.414 | -0.144 |
| 5.714557036879618 | 0.843 | 0.42 | -0.135 |
| 5.717698629533207 | 0.844 | 0.426 | -0.125 |
| 5.720840222186797 | 0.846 | 0.431 | -0.116 |
| 5.723981814840386 | 0.848 | 0.437 | -0.107 |
| 5.727123407493976 | 0.849 | 0.443 | -0.097 |
| 5.730265000147565 | 0.851 | 0.448 | -0.088 |
| 5.733406592801155 | 0.853 | 0.454 | -0.078 |
| 5.736548185454744 | 0.854 | 0.46 | -0.069 |
| 5.739689778108334 | 0.856 | 0.465 | -0.06 |
| 5.742831370761924 | 0.858 | 0.471 | -0.05 |
| 5.745972963415514 | 0.859 | 0.476 | -0.041 |
| 5.749114556069103 | 0.861 | 0.482 | -0.031 |
| 5.752256148722693 | 0.862 | 0.487 | -0.022 |
| 5.755397741376282 | 0.864 | 0.493 | -0.013 |
| 5.758539334029872 | 0.866 | 0.498 | -0.003 |
| 5.761680926683462 | 0.867 | 0.504 | 0.006 |
| 5.764822519337051 | 0.869 | 0.509 | 0.016 |
| 5.767964111990641 | 0.87 | 0.514 | 0.025 |
| 5.77110570464423 | 0.872 | 0.52 | 0.035 |
| 5.77424729729782 | 0.873 | 0.525 | 0.044 |
| 5.77738888995141 | 0.875 | 0.531 | 0.053 |
| 5.780530482605 | 0.876 | 0.536 | 0.063 |
| 5.783672075258588 | 0.878 | 0.541 | 0.072 |
| 5.786813667912178 | 0.879 | 0.546 | 0.082 |
| 5.789955260565768 | 0.881 | 0.552 | 0.091 |
| 5.793096853219358 | 0.882 | 0.557 | 0.1 |
| 5.796238445872947 | 0.884 | 0.562 | 0.11 |
| 5.799380038526537 | 0.885 | 0.567 | 0.119 |
| 5.802521631180126 | 0.887 | 0.572 | 0.128 |
| 5.805663223833715 | 0.888 | 0.578 | 0.138 |
| 5.808804816487306 | 0.89 | 0.583 | 0.147 |
| 5.811946409140895 | 0.891 | 0.588 | 0.156 |
| 5.815088001794485 | 0.892 | 0.593 | 0.166 |
| 5.818229594448074 | 0.894 | 0.598 | 0.175 |
| 5.821371187101663 | 0.895 | 0.603 | 0.184 |
| 5.824512779755254 | 0.897 | 0.608 | 0.194 |
| 5.827654372408843 | 0.898 | 0.613 | 0.203 |
| 5.830795965062433 | 0.899 | 0.618 | 0.212 |
| 5.833937557716022 | 0.901 | 0.623 | 0.221 |
| 5.837079150369612 | 0.902 | 0.628 | 0.23 |
| 5.840220743023201 | 0.903 | 0.633 | 0.24 |
| 5.843362335676791 | 0.905 | 0.637 | 0.249 |
| 5.846503928330381 | 0.906 | 0.642 | 0.258 |
| 5.84964552098397 | 0.907 | 0.647 | 0.267 |
| 5.85278711363756 | 0.909 | 0.652 | 0.276 |
| 5.85592870629115 | 0.91 | 0.657 | 0.285 |
| 5.85907029894474 | 0.911 | 0.661 | 0.294 |
| 5.862211891598329 | 0.913 | 0.666 | 0.303 |
| 5.865353484251918 | 0.914 | 0.671 | 0.312 |
| 5.868495076905508 | 0.915 | 0.675 | 0.321 |
| 5.871636669559098 | 0.917 | 0.68 | 0.33 |
| 5.874778262212687 | 0.918 | 0.685 | 0.339 |
| 5.877919854866277 | 0.919 | 0.689 | 0.348 |
| 5.881061447519866 | 0.92 | 0.694 | 0.356 |
| 5.884203040173456 | 0.921 | 0.698 | 0.365 |
| 5.887344632827046 | 0.923 | 0.703 | 0.374 |
| 5.890486225480635 | 0.924 | 0.707 | 0.383 |
| 5.893627818134224 | 0.925 | 0.712 | 0.391 |
| 5.896769410787814 | 0.926 | 0.716 | 0.4 |
| 5.899911003441404 | 0.927 | 0.72 | 0.409 |
| 5.903052596094994 | 0.929 | 0.725 | 0.417 |
| 5.906194188748583 | 0.93 | 0.729 | 0.426 |
| 5.909335781402172 | 0.931 | 0.733 | 0.434 |
| 5.912477374055762 | 0.932 | 0.738 | 0.443 |
| 5.915618966709352 | 0.933 | 0.742 | 0.451 |
| 5.918760559362942 | 0.934 | 0.746 | 0.46 |
| 5.921902152016531 | 0.935 | 0.75 | 0.468 |
| 5.92504374467012 | 0.937 | 0.754 | 0.476 |
| 5.92818533732371 | 0.938 | 0.758 | 0.485 |
| 5.9313269299773 | 0.939 | 0.762 | 0.493 |
| 5.93446852263089 | 0.94 | 0.766 | 0.501 |
| 5.93761011528448 | 0.941 | 0.771 | 0.509 |
| 5.940751707938068 | 0.942 | 0.775 | 0.517 |
| 5.943893300591658 | 0.943 | 0.778 | 0.525 |
| 5.947034893245248 | 0.944 | 0.782 | 0.533 |
| 5.950176485898837 | 0.945 | 0.786 | 0.541 |
| 5.953318078552427 | 0.946 | 0.79 | 0.549 |
| 5.956459671206017 | 0.947 | 0.794 | 0.557 |
| 5.959601263859606 | 0.948 | 0.798 | 0.565 |
| 5.962742856513196 | 0.949 | 0.802 | 0.572 |
| 5.965884449166785 | 0.95 | 0.805 | 0.58 |
| 5.969026041820375 | 0.951 | 0.809 | 0.588 |
| 5.972167634473964 | 0.952 | 0.813 | 0.595 |
| 5.975309227127554 | 0.953 | 0.816 | 0.603 |
| 5.978450819781144 | 0.954 | 0.82 | 0.61 |
| 5.981592412434733 | 0.955 | 0.824 | 0.618 |
| 5.984734005088323 | 0.956 | 0.827 | 0.625 |
| 5.987875597741913 | 0.957 | 0.831 | 0.633 |
| 5.991017190395502 | 0.958 | 0.834 | 0.64 |
| 5.994158783049092 | 0.959 | 0.838 | 0.647 |
| 5.997300375702681 | 0.959 | 0.841 | 0.654 |
| 6.000441968356271 | 0.96 | 0.844 | 0.661 |
| 6.003583561009861 | 0.961 | 0.848 | 0.668 |
| 6.00672515366345 | 0.962 | 0.851 | 0.675 |
| 6.00986674631704 | 0.963 | 0.854 | 0.682 |
| 6.01300833897063 | 0.964 | 0.858 | 0.689 |
| 6.01614993162422 | 0.965 | 0.861 | 0.696 |
| 6.019291524277808 | 0.965 | 0.864 | 0.703 |
| 6.022433116931398 | 0.966 | 0.867 | 0.709 |
| 6.025574709584988 | 0.967 | 0.87 | 0.716 |
| 6.028716302238577 | 0.968 | 0.873 | 0.722 |
| 6.031857894892167 | 0.969 | 0.876 | 0.729 |
| 6.034999487545757 | 0.969 | 0.879 | 0.735 |
| 6.038141080199346 | 0.97 | 0.882 | 0.742 |
| 6.041282672852935 | 0.971 | 0.885 | 0.748 |
| 6.044424265506525 | 0.972 | 0.888 | 0.754 |
| 6.047565858160115 | 0.972 | 0.891 | 0.76 |
| 6.050707450813704 | 0.973 | 0.894 | 0.766 |
| 6.053849043467294 | 0.974 | 0.897 | 0.773 |
| 6.056990636120884 | 0.975 | 0.899 | 0.778 |
| 6.060132228774473 | 0.975 | 0.902 | 0.784 |
| 6.063273821428063 | 0.976 | 0.905 | 0.79 |
| 6.066415414081653 | 0.977 | 0.907 | 0.796 |
| 6.069557006735242 | 0.977 | 0.91 | 0.802 |
| 6.072698599388831 | 0.978 | 0.913 | 0.807 |
| 6.07584019204242 | 0.979 | 0.915 | 0.813 |
| 6.078981784696011 | 0.979 | 0.918 | 0.818 |
| 6.082123377349601 | 0.98 | 0.92 | 0.824 |
| 6.08526497000319 | 0.98 | 0.923 | 0.829 |
| 6.08840656265678 | 0.981 | 0.925 | 0.834 |
| 6.09154815531037 | 0.982 | 0.927 | 0.839 |
| 6.094689747963959 | 0.982 | 0.93 | 0.844 |
| 6.097831340617549 | 0.983 | 0.932 | 0.849 |
| 6.100972933271138 | 0.983 | 0.934 | 0.854 |
| 6.104114525924728 | 0.984 | 0.937 | 0.859 |
| 6.107256118578317 | 0.985 | 0.939 | 0.864 |
| 6.110397711231907 | 0.985 | 0.941 | 0.869 |
| 6.113539303885497 | 0.986 | 0.943 | 0.873 |
| 6.116680896539086 | 0.986 | 0.945 | 0.878 |
| 6.119822489192675 | 0.987 | 0.947 | 0.882 |
| 6.122964081846265 | 0.987 | 0.949 | 0.887 |
| 6.126105674499855 | 0.988 | 0.951 | 0.891 |
| 6.129247267153445 | 0.988 | 0.953 | 0.895 |
| 6.132388859807034 | 0.989 | 0.955 | 0.899 |
| 6.135530452460624 | 0.989 | 0.957 | 0.903 |
| 6.138672045114213 | 0.99 | 0.959 | 0.907 |
| 6.141813637767803 | 0.99 | 0.96 | 0.911 |
| 6.144955230421393 | 0.99 | 0.962 | 0.915 |
| 6.148096823074982 | 0.991 | 0.964 | 0.919 |
| 6.151238415728571 | 0.991 | 0.965 | 0.923 |
| 6.154380008382161 | 0.992 | 0.967 | 0.926 |
| 6.157521601035751 | 0.992 | 0.969 | 0.93 |
| 6.16066319368934 | 0.993 | 0.97 | 0.933 |
| 6.16380478634293 | 0.993 | 0.972 | 0.937 |
| 6.16694637899652 | 0.993 | 0.973 | 0.94 |
| 6.170087971650109 | 0.994 | 0.975 | 0.943 |
| 6.173229564303698 | 0.994 | 0.976 | 0.946 |
| 6.176371156957289 | 0.994 | 0.977 | 0.949 |
| 6.179512749610878 | 0.995 | 0.979 | 0.952 |
| 6.182654342264468 | 0.995 | 0.98 | 0.955 |
| 6.185795934918057 | 0.995 | 0.981 | 0.958 |
| 6.188937527571647 | 0.996 | 0.982 | 0.96 |
| 6.192079120225237 | 0.996 | 0.983 | 0.963 |
| 6.195220712878826 | 0.996 | 0.985 | 0.965 |
| 6.198362305532415 | 0.996 | 0.986 | 0.968 |
| 6.201503898186005 | 0.997 | 0.987 | 0.97 |
| 6.204645490839594 | 0.997 | 0.988 | 0.972 |
| 6.207787083493184 | 0.997 | 0.989 | 0.975 |
| 6.210928676146774 | 0.997 | 0.99 | 0.977 |
| 6.214070268800364 | 0.998 | 0.99 | 0.979 |
| 6.217211861453953 | 0.998 | 0.991 | 0.98 |
| 6.220353454107543 | 0.998 | 0.992 | 0.982 |
| 6.223495046761133 | 0.998 | 0.993 | 0.984 |
| 6.226636639414722 | 0.998 | 0.994 | 0.986 |
| 6.229778232068312 | 0.999 | 0.994 | 0.987 |
| 6.232919824721901 | 0.999 | 0.995 | 0.989 |
| 6.236061417375491 | 0.999 | 0.996 | 0.99 |
| 6.23920301002908 | 0.999 | 0.996 | 0.991 |
| 6.24234460268267 | 0.999 | 0.997 | 0.993 |
| 6.24548619533626 | 0.999 | 0.997 | 0.994 |
| 6.24862778798985 | 0.999 | 0.998 | 0.995 |
| 6.251769380643438 | 1 | 0.998 | 0.996 |
| 6.254910973297028 | 1 | 0.998 | 0.996 |
| 6.258052565950618 | 1 | 0.999 | 0.997 |
| 6.261194158604208 | 1 | 0.999 | 0.998 |
| 6.264335751257797 | 1 | 0.999 | 0.998 |
| 6.267477343911387 | 1 | 1 | 0.999 |
| 6.270618936564976 | 1 | 1 | 0.999 |
| 6.273760529218566 | 1 | 1 | 1 |
| 6.276902121872155 | 1 | 1 | 1 |
| 6.280043714525745 | 1 | 1 | 1 |
| 6.283185307179335 | 1 | 1 | 1 |